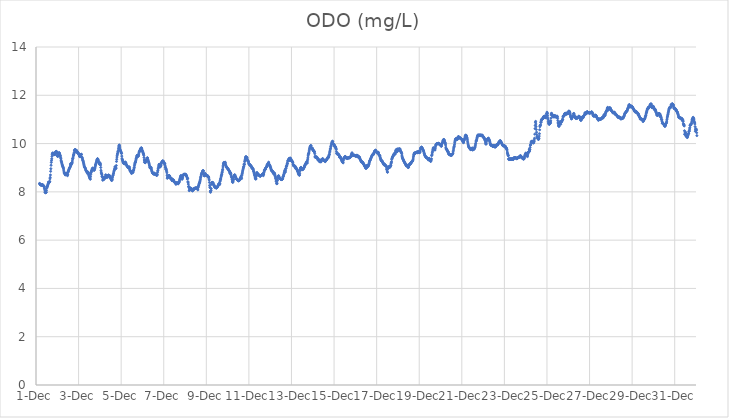
| Category | ODO (mg/L) |
|---|---|
| 44896.166666666664 | 8.35 |
| 44896.177083333336 | 8.34 |
| 44896.1875 | 8.31 |
| 44896.197916666664 | 8.3 |
| 44896.208333333336 | 8.3 |
| 44896.21875 | 8.29 |
| 44896.229166666664 | 8.28 |
| 44896.239583333336 | 8.29 |
| 44896.25 | 8.28 |
| 44896.260416666664 | 8.28 |
| 44896.270833333336 | 8.28 |
| 44896.28125 | 8.28 |
| 44896.291666666664 | 8.29 |
| 44896.302083333336 | 8.3 |
| 44896.3125 | 8.29 |
| 44896.322916666664 | 8.29 |
| 44896.333333333336 | 8.26 |
| 44896.34375 | 8.25 |
| 44896.354166666664 | 8.23 |
| 44896.364583333336 | 8.25 |
| 44896.375 | 8.22 |
| 44896.385416666664 | 8.21 |
| 44896.395833333336 | 8.15 |
| 44896.40625 | 8.11 |
| 44896.416666666664 | 8.04 |
| 44896.427083333336 | 7.98 |
| 44896.4375 | 7.97 |
| 44896.447916666664 | 7.99 |
| 44896.458333333336 | 7.96 |
| 44896.46875 | 7.98 |
| 44896.479166666664 | 7.98 |
| 44896.489583333336 | 8.05 |
| 44896.5 | 8.14 |
| 44896.510416666664 | 8.19 |
| 44896.520833333336 | 8.2 |
| 44896.53125 | 8.22 |
| 44896.541666666664 | 8.25 |
| 44896.552083333336 | 8.28 |
| 44896.5625 | 8.31 |
| 44896.572916666664 | 8.34 |
| 44896.583333333336 | 8.41 |
| 44896.59375 | 8.36 |
| 44896.604166666664 | 8.39 |
| 44896.614583333336 | 8.39 |
| 44896.625 | 8.4 |
| 44896.635416666664 | 8.42 |
| 44896.645833333336 | 8.43 |
| 44896.65625 | 8.54 |
| 44896.666666666664 | 8.6 |
| 44896.677083333336 | 8.7 |
| 44896.6875 | 8.85 |
| 44896.697916666664 | 8.96 |
| 44896.708333333336 | 9.1 |
| 44896.71875 | 9.22 |
| 44896.729166666664 | 9.3 |
| 44896.739583333336 | 9.37 |
| 44896.75 | 9.47 |
| 44896.760416666664 | 9.55 |
| 44896.770833333336 | 9.59 |
| 44896.78125 | 9.6 |
| 44896.791666666664 | 9.61 |
| 44896.802083333336 | 9.6 |
| 44896.8125 | 9.59 |
| 44896.822916666664 | 9.58 |
| 44896.833333333336 | 9.58 |
| 44896.84375 | 9.55 |
| 44896.854166666664 | 9.55 |
| 44896.864583333336 | 9.55 |
| 44896.875 | 9.55 |
| 44896.885416666664 | 9.54 |
| 44896.895833333336 | 9.57 |
| 44896.90625 | 9.63 |
| 44896.916666666664 | 9.65 |
| 44896.927083333336 | 9.63 |
| 44896.9375 | 9.63 |
| 44896.947916666664 | 9.68 |
| 44896.958333333336 | 9.67 |
| 44896.96875 | 9.66 |
| 44896.979166666664 | 9.64 |
| 44896.989583333336 | 9.59 |
| 44897.0 | 9.51 |
| 44897.010416666664 | 9.47 |
| 44897.020833333336 | 9.47 |
| 44897.03125 | 9.48 |
| 44897.041666666664 | 9.5 |
| 44897.052083333336 | 9.55 |
| 44897.0625 | 9.55 |
| 44897.072916666664 | 9.61 |
| 44897.083333333336 | 9.62 |
| 44897.09375 | 9.62 |
| 44897.104166666664 | 9.58 |
| 44897.114583333336 | 9.56 |
| 44897.125 | 9.5 |
| 44897.135416666664 | 9.52 |
| 44897.145833333336 | 9.48 |
| 44897.15625 | 9.42 |
| 44897.166666666664 | 9.38 |
| 44897.177083333336 | 9.31 |
| 44897.1875 | 9.27 |
| 44897.197916666664 | 9.24 |
| 44897.208333333336 | 9.2 |
| 44897.21875 | 9.16 |
| 44897.229166666664 | 9.12 |
| 44897.239583333336 | 9.1 |
| 44897.25 | 9.07 |
| 44897.260416666664 | 9.05 |
| 44897.270833333336 | 9.02 |
| 44897.28125 | 9 |
| 44897.291666666664 | 8.96 |
| 44897.302083333336 | 8.9 |
| 44897.3125 | 8.83 |
| 44897.322916666664 | 8.78 |
| 44897.333333333336 | 8.79 |
| 44897.34375 | 8.77 |
| 44897.354166666664 | 8.75 |
| 44897.364583333336 | 8.72 |
| 44897.375 | 8.7 |
| 44897.385416666664 | 8.75 |
| 44897.395833333336 | 8.76 |
| 44897.40625 | 8.77 |
| 44897.416666666664 | 8.75 |
| 44897.427083333336 | 8.77 |
| 44897.4375 | 8.76 |
| 44897.447916666664 | 8.74 |
| 44897.458333333336 | 8.71 |
| 44897.46875 | 8.7 |
| 44897.479166666664 | 8.67 |
| 44897.489583333336 | 8.72 |
| 44897.5 | 8.8 |
| 44897.510416666664 | 8.83 |
| 44897.520833333336 | 8.87 |
| 44897.53125 | 8.87 |
| 44897.541666666664 | 8.91 |
| 44897.552083333336 | 8.93 |
| 44897.5625 | 8.97 |
| 44897.572916666664 | 8.98 |
| 44897.583333333336 | 9 |
| 44897.59375 | 9.01 |
| 44897.604166666664 | 9.04 |
| 44897.614583333336 | 9.15 |
| 44897.625 | 9.1 |
| 44897.635416666664 | 9.08 |
| 44897.645833333336 | 9.18 |
| 44897.65625 | 9.14 |
| 44897.666666666664 | 9.16 |
| 44897.677083333336 | 9.17 |
| 44897.6875 | 9.19 |
| 44897.697916666664 | 9.22 |
| 44897.708333333336 | 9.28 |
| 44897.71875 | 9.36 |
| 44897.729166666664 | 9.38 |
| 44897.739583333336 | 9.41 |
| 44897.75 | 9.48 |
| 44897.760416666664 | 9.52 |
| 44897.770833333336 | 9.54 |
| 44897.78125 | 9.58 |
| 44897.791666666664 | 9.62 |
| 44897.802083333336 | 9.7 |
| 44897.8125 | 9.72 |
| 44897.822916666664 | 9.74 |
| 44897.833333333336 | 9.75 |
| 44897.84375 | 9.75 |
| 44897.854166666664 | 9.74 |
| 44897.864583333336 | 9.72 |
| 44897.875 | 9.7 |
| 44897.885416666664 | 9.65 |
| 44897.895833333336 | 9.65 |
| 44897.90625 | 9.72 |
| 44897.916666666664 | 9.67 |
| 44897.927083333336 | 9.64 |
| 44897.9375 | 9.65 |
| 44897.947916666664 | 9.66 |
| 44897.958333333336 | 9.64 |
| 44897.96875 | 9.6 |
| 44897.979166666664 | 9.61 |
| 44897.989583333336 | 9.58 |
| 44898.0 | 9.6 |
| 44898.010416666664 | 9.56 |
| 44898.020833333336 | 9.53 |
| 44898.03125 | 9.53 |
| 44898.041666666664 | 9.49 |
| 44898.052083333336 | 9.46 |
| 44898.0625 | 9.46 |
| 44898.072916666664 | 9.47 |
| 44898.083333333336 | 9.49 |
| 44898.09375 | 9.51 |
| 44898.104166666664 | 9.53 |
| 44898.114583333336 | 9.54 |
| 44898.125 | 9.56 |
| 44898.135416666664 | 9.55 |
| 44898.145833333336 | 9.45 |
| 44898.15625 | 9.43 |
| 44898.166666666664 | 9.41 |
| 44898.177083333336 | 9.39 |
| 44898.1875 | 9.34 |
| 44898.197916666664 | 9.31 |
| 44898.208333333336 | 9.29 |
| 44898.21875 | 9.25 |
| 44898.229166666664 | 9.22 |
| 44898.239583333336 | 9.17 |
| 44898.25 | 9.13 |
| 44898.260416666664 | 9.09 |
| 44898.270833333336 | 9.05 |
| 44898.28125 | 9.03 |
| 44898.291666666664 | 9.02 |
| 44898.302083333336 | 9 |
| 44898.3125 | 8.98 |
| 44898.322916666664 | 8.96 |
| 44898.333333333336 | 8.92 |
| 44898.34375 | 8.89 |
| 44898.354166666664 | 8.87 |
| 44898.364583333336 | 8.86 |
| 44898.375 | 8.85 |
| 44898.385416666664 | 8.83 |
| 44898.395833333336 | 8.83 |
| 44898.40625 | 8.81 |
| 44898.416666666664 | 8.76 |
| 44898.427083333336 | 8.81 |
| 44898.4375 | 8.82 |
| 44898.447916666664 | 8.81 |
| 44898.458333333336 | 8.78 |
| 44898.46875 | 8.76 |
| 44898.479166666664 | 8.7 |
| 44898.489583333336 | 8.67 |
| 44898.5 | 8.63 |
| 44898.510416666664 | 8.62 |
| 44898.520833333336 | 8.57 |
| 44898.53125 | 8.6 |
| 44898.541666666664 | 8.56 |
| 44898.552083333336 | 8.52 |
| 44898.5625 | 8.64 |
| 44898.572916666664 | 8.73 |
| 44898.583333333336 | 8.79 |
| 44898.59375 | 8.82 |
| 44898.604166666664 | 8.86 |
| 44898.614583333336 | 8.88 |
| 44898.625 | 8.91 |
| 44898.635416666664 | 8.94 |
| 44898.645833333336 | 8.96 |
| 44898.65625 | 8.98 |
| 44898.666666666664 | 8.98 |
| 44898.677083333336 | 8.95 |
| 44898.6875 | 8.92 |
| 44898.697916666664 | 8.93 |
| 44898.708333333336 | 8.93 |
| 44898.71875 | 8.9 |
| 44898.729166666664 | 8.89 |
| 44898.739583333336 | 8.91 |
| 44898.75 | 8.94 |
| 44898.760416666664 | 8.97 |
| 44898.770833333336 | 9 |
| 44898.78125 | 9.05 |
| 44898.791666666664 | 9.11 |
| 44898.802083333336 | 9.12 |
| 44898.8125 | 9.16 |
| 44898.822916666664 | 9.19 |
| 44898.833333333336 | 9.22 |
| 44898.84375 | 9.26 |
| 44898.854166666664 | 9.31 |
| 44898.864583333336 | 9.32 |
| 44898.875 | 9.35 |
| 44898.885416666664 | 9.37 |
| 44898.895833333336 | 9.37 |
| 44898.90625 | 9.35 |
| 44898.916666666664 | 9.33 |
| 44898.927083333336 | 9.29 |
| 44898.9375 | 9.26 |
| 44898.947916666664 | 9.21 |
| 44898.958333333336 | 9.21 |
| 44898.96875 | 9.2 |
| 44898.979166666664 | 9.15 |
| 44898.989583333336 | 9.14 |
| 44899.0 | 9.21 |
| 44899.010416666664 | 9.17 |
| 44899.020833333336 | 9.16 |
| 44899.03125 | 9.11 |
| 44899.041666666664 | 9.01 |
| 44899.052083333336 | 8.89 |
| 44899.0625 | 8.82 |
| 44899.072916666664 | 8.77 |
| 44899.083333333336 | 8.75 |
| 44899.09375 | 8.71 |
| 44899.104166666664 | 8.64 |
| 44899.114583333336 | 8.64 |
| 44899.125 | 8.6 |
| 44899.135416666664 | 8.48 |
| 44899.145833333336 | 8.52 |
| 44899.15625 | 8.57 |
| 44899.166666666664 | 8.52 |
| 44899.177083333336 | 8.55 |
| 44899.1875 | 8.51 |
| 44899.197916666664 | 8.59 |
| 44899.208333333336 | 8.59 |
| 44899.21875 | 8.55 |
| 44899.229166666664 | 8.57 |
| 44899.239583333336 | 8.58 |
| 44899.25 | 8.59 |
| 44899.260416666664 | 8.62 |
| 44899.270833333336 | 8.7 |
| 44899.28125 | 8.7 |
| 44899.291666666664 | 8.68 |
| 44899.302083333336 | 8.65 |
| 44899.3125 | 8.62 |
| 44899.322916666664 | 8.6 |
| 44899.333333333336 | 8.6 |
| 44899.34375 | 8.61 |
| 44899.354166666664 | 8.63 |
| 44899.364583333336 | 8.64 |
| 44899.375 | 8.66 |
| 44899.385416666664 | 8.67 |
| 44899.395833333336 | 8.69 |
| 44899.40625 | 8.69 |
| 44899.416666666664 | 8.69 |
| 44899.427083333336 | 8.68 |
| 44899.4375 | 8.67 |
| 44899.447916666664 | 8.68 |
| 44899.458333333336 | 8.66 |
| 44899.46875 | 8.58 |
| 44899.479166666664 | 8.62 |
| 44899.489583333336 | 8.61 |
| 44899.5 | 8.6 |
| 44899.510416666664 | 8.57 |
| 44899.520833333336 | 8.55 |
| 44899.53125 | 8.51 |
| 44899.541666666664 | 8.5 |
| 44899.552083333336 | 8.47 |
| 44899.5625 | 8.48 |
| 44899.572916666664 | 8.5 |
| 44899.583333333336 | 8.53 |
| 44899.59375 | 8.6 |
| 44899.604166666664 | 8.66 |
| 44899.614583333336 | 8.69 |
| 44899.625 | 8.7 |
| 44899.635416666664 | 8.75 |
| 44899.645833333336 | 8.78 |
| 44899.65625 | 8.83 |
| 44899.666666666664 | 8.87 |
| 44899.677083333336 | 8.9 |
| 44899.6875 | 8.93 |
| 44899.697916666664 | 8.96 |
| 44899.708333333336 | 9.04 |
| 44899.71875 | 9.01 |
| 44899.729166666664 | 9.02 |
| 44899.739583333336 | 8.96 |
| 44899.75 | 8.97 |
| 44899.760416666664 | 8.99 |
| 44899.770833333336 | 9.09 |
| 44899.78125 | 9.26 |
| 44899.791666666664 | 9.35 |
| 44899.802083333336 | 9.44 |
| 44899.8125 | 9.5 |
| 44899.822916666664 | 9.56 |
| 44899.833333333336 | 9.59 |
| 44899.84375 | 9.65 |
| 44899.854166666664 | 9.66 |
| 44899.864583333336 | 9.72 |
| 44899.875 | 9.8 |
| 44899.885416666664 | 9.86 |
| 44899.895833333336 | 9.91 |
| 44899.90625 | 9.94 |
| 44899.916666666664 | 9.93 |
| 44899.927083333336 | 9.88 |
| 44899.9375 | 9.82 |
| 44899.947916666664 | 9.77 |
| 44899.958333333336 | 9.72 |
| 44899.96875 | 9.72 |
| 44899.979166666664 | 9.69 |
| 44899.989583333336 | 9.67 |
| 44900.0 | 9.63 |
| 44900.010416666664 | 9.6 |
| 44900.020833333336 | 9.59 |
| 44900.03125 | 9.48 |
| 44900.041666666664 | 9.38 |
| 44900.052083333336 | 9.33 |
| 44900.0625 | 9.32 |
| 44900.072916666664 | 9.28 |
| 44900.083333333336 | 9.25 |
| 44900.09375 | 9.22 |
| 44900.104166666664 | 9.2 |
| 44900.114583333336 | 9.18 |
| 44900.125 | 9.18 |
| 44900.135416666664 | 9.17 |
| 44900.145833333336 | 9.16 |
| 44900.15625 | 9.17 |
| 44900.166666666664 | 9.2 |
| 44900.177083333336 | 9.21 |
| 44900.1875 | 9.24 |
| 44900.197916666664 | 9.18 |
| 44900.208333333336 | 9.22 |
| 44900.21875 | 9.2 |
| 44900.229166666664 | 9.15 |
| 44900.239583333336 | 9.14 |
| 44900.25 | 9.13 |
| 44900.260416666664 | 9.1 |
| 44900.270833333336 | 9.07 |
| 44900.28125 | 9.06 |
| 44900.291666666664 | 9.07 |
| 44900.302083333336 | 9.05 |
| 44900.3125 | 9.02 |
| 44900.322916666664 | 9 |
| 44900.333333333336 | 9 |
| 44900.34375 | 8.99 |
| 44900.354166666664 | 9 |
| 44900.364583333336 | 9.01 |
| 44900.375 | 9.03 |
| 44900.385416666664 | 9.03 |
| 44900.395833333336 | 8.96 |
| 44900.40625 | 8.91 |
| 44900.416666666664 | 8.88 |
| 44900.427083333336 | 8.86 |
| 44900.4375 | 8.85 |
| 44900.447916666664 | 8.83 |
| 44900.458333333336 | 8.83 |
| 44900.46875 | 8.84 |
| 44900.479166666664 | 8.82 |
| 44900.489583333336 | 8.76 |
| 44900.5 | 8.78 |
| 44900.510416666664 | 8.81 |
| 44900.520833333336 | 8.81 |
| 44900.53125 | 8.81 |
| 44900.541666666664 | 8.82 |
| 44900.552083333336 | 8.8 |
| 44900.5625 | 8.83 |
| 44900.572916666664 | 8.88 |
| 44900.583333333336 | 8.9 |
| 44900.59375 | 8.91 |
| 44900.604166666664 | 8.98 |
| 44900.614583333336 | 9.01 |
| 44900.625 | 9.08 |
| 44900.635416666664 | 9.14 |
| 44900.645833333336 | 9.18 |
| 44900.65625 | 9.22 |
| 44900.666666666664 | 9.23 |
| 44900.677083333336 | 9.24 |
| 44900.6875 | 9.29 |
| 44900.697916666664 | 9.35 |
| 44900.708333333336 | 9.38 |
| 44900.71875 | 9.42 |
| 44900.729166666664 | 9.45 |
| 44900.739583333336 | 9.49 |
| 44900.75 | 9.51 |
| 44900.760416666664 | 9.51 |
| 44900.770833333336 | 9.49 |
| 44900.78125 | 9.53 |
| 44900.791666666664 | 9.47 |
| 44900.802083333336 | 9.47 |
| 44900.8125 | 9.51 |
| 44900.822916666664 | 9.54 |
| 44900.833333333336 | 9.61 |
| 44900.84375 | 9.65 |
| 44900.854166666664 | 9.66 |
| 44900.864583333336 | 9.68 |
| 44900.875 | 9.71 |
| 44900.885416666664 | 9.73 |
| 44900.895833333336 | 9.73 |
| 44900.90625 | 9.76 |
| 44900.916666666664 | 9.79 |
| 44900.927083333336 | 9.8 |
| 44900.9375 | 9.82 |
| 44900.947916666664 | 9.82 |
| 44900.958333333336 | 9.81 |
| 44900.96875 | 9.78 |
| 44900.979166666664 | 9.74 |
| 44900.989583333336 | 9.71 |
| 44901.0 | 9.68 |
| 44901.010416666664 | 9.67 |
| 44901.020833333336 | 9.63 |
| 44901.03125 | 9.61 |
| 44901.041666666664 | 9.58 |
| 44901.052083333336 | 9.56 |
| 44901.0625 | 9.51 |
| 44901.072916666664 | 9.42 |
| 44901.083333333336 | 9.32 |
| 44901.09375 | 9.23 |
| 44901.104166666664 | 9.31 |
| 44901.114583333336 | 9.27 |
| 44901.125 | 9.21 |
| 44901.135416666664 | 9.21 |
| 44901.145833333336 | 9.26 |
| 44901.15625 | 9.25 |
| 44901.166666666664 | 9.29 |
| 44901.177083333336 | 9.3 |
| 44901.1875 | 9.33 |
| 44901.197916666664 | 9.35 |
| 44901.208333333336 | 9.38 |
| 44901.21875 | 9.4 |
| 44901.229166666664 | 9.41 |
| 44901.239583333336 | 9.4 |
| 44901.25 | 9.33 |
| 44901.260416666664 | 9.32 |
| 44901.270833333336 | 9.28 |
| 44901.28125 | 9.26 |
| 44901.291666666664 | 9.23 |
| 44901.302083333336 | 9.2 |
| 44901.3125 | 9.17 |
| 44901.322916666664 | 9.12 |
| 44901.333333333336 | 9.08 |
| 44901.34375 | 9.03 |
| 44901.354166666664 | 9 |
| 44901.364583333336 | 8.99 |
| 44901.375 | 8.98 |
| 44901.385416666664 | 8.99 |
| 44901.395833333336 | 9.01 |
| 44901.40625 | 9.01 |
| 44901.416666666664 | 8.97 |
| 44901.427083333336 | 8.91 |
| 44901.4375 | 8.87 |
| 44901.447916666664 | 8.84 |
| 44901.458333333336 | 8.82 |
| 44901.46875 | 8.79 |
| 44901.479166666664 | 8.78 |
| 44901.489583333336 | 8.77 |
| 44901.5 | 8.76 |
| 44901.510416666664 | 8.76 |
| 44901.520833333336 | 8.73 |
| 44901.53125 | 8.76 |
| 44901.541666666664 | 8.77 |
| 44901.552083333336 | 8.78 |
| 44901.5625 | 8.75 |
| 44901.572916666664 | 8.74 |
| 44901.583333333336 | 8.73 |
| 44901.59375 | 8.74 |
| 44901.604166666664 | 8.72 |
| 44901.614583333336 | 8.74 |
| 44901.625 | 8.72 |
| 44901.635416666664 | 8.71 |
| 44901.645833333336 | 8.7 |
| 44901.65625 | 8.71 |
| 44901.666666666664 | 8.68 |
| 44901.677083333336 | 8.69 |
| 44901.6875 | 8.7 |
| 44901.697916666664 | 8.73 |
| 44901.708333333336 | 8.81 |
| 44901.71875 | 8.87 |
| 44901.729166666664 | 8.9 |
| 44901.739583333336 | 8.96 |
| 44901.75 | 9 |
| 44901.760416666664 | 9.06 |
| 44901.770833333336 | 9.1 |
| 44901.78125 | 9.14 |
| 44901.791666666664 | 9.14 |
| 44901.802083333336 | 9.08 |
| 44901.8125 | 9.07 |
| 44901.822916666664 | 9.05 |
| 44901.833333333336 | 9.03 |
| 44901.84375 | 9.07 |
| 44901.854166666664 | 9.06 |
| 44901.864583333336 | 9.1 |
| 44901.875 | 9.12 |
| 44901.885416666664 | 9.18 |
| 44901.895833333336 | 9.21 |
| 44901.90625 | 9.23 |
| 44901.916666666664 | 9.23 |
| 44901.927083333336 | 9.25 |
| 44901.9375 | 9.27 |
| 44901.947916666664 | 9.28 |
| 44901.958333333336 | 9.28 |
| 44901.96875 | 9.27 |
| 44901.979166666664 | 9.26 |
| 44901.989583333336 | 9.26 |
| 44902.0 | 9.23 |
| 44902.010416666664 | 9.22 |
| 44902.020833333336 | 9.2 |
| 44902.03125 | 9.16 |
| 44902.041666666664 | 9.17 |
| 44902.052083333336 | 9.16 |
| 44902.0625 | 9.1 |
| 44902.072916666664 | 9.02 |
| 44902.083333333336 | 9.02 |
| 44902.09375 | 8.94 |
| 44902.104166666664 | 8.96 |
| 44902.114583333336 | 8.94 |
| 44902.125 | 8.9 |
| 44902.135416666664 | 8.85 |
| 44902.145833333336 | 8.79 |
| 44902.15625 | 8.69 |
| 44902.166666666664 | 8.56 |
| 44902.177083333336 | 8.61 |
| 44902.1875 | 8.59 |
| 44902.197916666664 | 8.63 |
| 44902.208333333336 | 8.6 |
| 44902.21875 | 8.65 |
| 44902.229166666664 | 8.65 |
| 44902.239583333336 | 8.67 |
| 44902.25 | 8.68 |
| 44902.260416666664 | 8.67 |
| 44902.270833333336 | 8.66 |
| 44902.28125 | 8.65 |
| 44902.291666666664 | 8.6 |
| 44902.302083333336 | 8.58 |
| 44902.3125 | 8.57 |
| 44902.322916666664 | 8.55 |
| 44902.333333333336 | 8.54 |
| 44902.34375 | 8.54 |
| 44902.354166666664 | 8.56 |
| 44902.364583333336 | 8.56 |
| 44902.375 | 8.52 |
| 44902.385416666664 | 8.48 |
| 44902.395833333336 | 8.46 |
| 44902.40625 | 8.47 |
| 44902.416666666664 | 8.48 |
| 44902.427083333336 | 8.49 |
| 44902.4375 | 8.5 |
| 44902.447916666664 | 8.5 |
| 44902.458333333336 | 8.48 |
| 44902.46875 | 8.46 |
| 44902.479166666664 | 8.44 |
| 44902.489583333336 | 8.42 |
| 44902.5 | 8.41 |
| 44902.510416666664 | 8.4 |
| 44902.520833333336 | 8.4 |
| 44902.53125 | 8.38 |
| 44902.541666666664 | 8.36 |
| 44902.552083333336 | 8.37 |
| 44902.5625 | 8.37 |
| 44902.572916666664 | 8.31 |
| 44902.583333333336 | 8.38 |
| 44902.59375 | 8.37 |
| 44902.604166666664 | 8.35 |
| 44902.614583333336 | 8.37 |
| 44902.625 | 8.35 |
| 44902.635416666664 | 8.38 |
| 44902.645833333336 | 8.37 |
| 44902.65625 | 8.35 |
| 44902.666666666664 | 8.35 |
| 44902.677083333336 | 8.33 |
| 44902.6875 | 8.37 |
| 44902.697916666664 | 8.36 |
| 44902.708333333336 | 8.38 |
| 44902.71875 | 8.4 |
| 44902.729166666664 | 8.42 |
| 44902.739583333336 | 8.46 |
| 44902.75 | 8.52 |
| 44902.760416666664 | 8.53 |
| 44902.770833333336 | 8.57 |
| 44902.78125 | 8.6 |
| 44902.791666666664 | 8.64 |
| 44902.802083333336 | 8.66 |
| 44902.8125 | 8.68 |
| 44902.822916666664 | 8.64 |
| 44902.833333333336 | 8.58 |
| 44902.84375 | 8.57 |
| 44902.854166666664 | 8.54 |
| 44902.864583333336 | 8.52 |
| 44902.875 | 8.57 |
| 44902.885416666664 | 8.59 |
| 44902.895833333336 | 8.65 |
| 44902.90625 | 8.69 |
| 44902.916666666664 | 8.7 |
| 44902.927083333336 | 8.71 |
| 44902.9375 | 8.72 |
| 44902.947916666664 | 8.73 |
| 44902.958333333336 | 8.72 |
| 44902.96875 | 8.72 |
| 44902.979166666664 | 8.73 |
| 44902.989583333336 | 8.72 |
| 44903.0 | 8.73 |
| 44903.010416666664 | 8.73 |
| 44903.020833333336 | 8.72 |
| 44903.03125 | 8.69 |
| 44903.041666666664 | 8.72 |
| 44903.052083333336 | 8.69 |
| 44903.0625 | 8.68 |
| 44903.072916666664 | 8.65 |
| 44903.083333333336 | 8.65 |
| 44903.09375 | 8.59 |
| 44903.104166666664 | 8.53 |
| 44903.114583333336 | 8.55 |
| 44903.125 | 8.56 |
| 44903.135416666664 | 8.42 |
| 44903.145833333336 | 8.39 |
| 44903.15625 | 8.32 |
| 44903.166666666664 | 8.22 |
| 44903.177083333336 | 8.22 |
| 44903.1875 | 8.17 |
| 44903.197916666664 | 8.05 |
| 44903.208333333336 | 8.06 |
| 44903.21875 | 8.11 |
| 44903.229166666664 | 8.17 |
| 44903.239583333336 | 8.09 |
| 44903.25 | 8.15 |
| 44903.260416666664 | 8.14 |
| 44903.270833333336 | 8.15 |
| 44903.28125 | 8.14 |
| 44903.291666666664 | 8.14 |
| 44903.302083333336 | 8.13 |
| 44903.3125 | 8.12 |
| 44903.322916666664 | 8.07 |
| 44903.333333333336 | 8.08 |
| 44903.34375 | 8.05 |
| 44903.354166666664 | 8.04 |
| 44903.364583333336 | 8.06 |
| 44903.375 | 8.08 |
| 44903.385416666664 | 8.09 |
| 44903.395833333336 | 8.13 |
| 44903.40625 | 8.12 |
| 44903.416666666664 | 8.11 |
| 44903.427083333336 | 8.11 |
| 44903.4375 | 8.12 |
| 44903.447916666664 | 8.13 |
| 44903.458333333336 | 8.14 |
| 44903.46875 | 8.16 |
| 44903.479166666664 | 8.16 |
| 44903.489583333336 | 8.15 |
| 44903.5 | 8.15 |
| 44903.510416666664 | 8.16 |
| 44903.520833333336 | 8.16 |
| 44903.53125 | 8.16 |
| 44903.541666666664 | 8.15 |
| 44903.552083333336 | 8.16 |
| 44903.5625 | 8.16 |
| 44903.572916666664 | 8.14 |
| 44903.583333333336 | 8.14 |
| 44903.59375 | 8.12 |
| 44903.604166666664 | 8.08 |
| 44903.614583333336 | 8.18 |
| 44903.625 | 8.21 |
| 44903.635416666664 | 8.26 |
| 44903.645833333336 | 8.28 |
| 44903.65625 | 8.32 |
| 44903.666666666664 | 8.35 |
| 44903.677083333336 | 8.37 |
| 44903.6875 | 8.4 |
| 44903.697916666664 | 8.42 |
| 44903.708333333336 | 8.47 |
| 44903.71875 | 8.52 |
| 44903.729166666664 | 8.58 |
| 44903.739583333336 | 8.62 |
| 44903.75 | 8.65 |
| 44903.760416666664 | 8.7 |
| 44903.770833333336 | 8.73 |
| 44903.78125 | 8.77 |
| 44903.791666666664 | 8.77 |
| 44903.802083333336 | 8.79 |
| 44903.8125 | 8.81 |
| 44903.822916666664 | 8.85 |
| 44903.833333333336 | 8.86 |
| 44903.84375 | 8.88 |
| 44903.854166666664 | 8.88 |
| 44903.864583333336 | 8.86 |
| 44903.875 | 8.76 |
| 44903.885416666664 | 8.73 |
| 44903.895833333336 | 8.67 |
| 44903.90625 | 8.66 |
| 44903.916666666664 | 8.68 |
| 44903.927083333336 | 8.71 |
| 44903.9375 | 8.75 |
| 44903.947916666664 | 8.76 |
| 44903.958333333336 | 8.74 |
| 44903.96875 | 8.71 |
| 44903.979166666664 | 8.69 |
| 44903.989583333336 | 8.69 |
| 44904.0 | 8.67 |
| 44904.010416666664 | 8.68 |
| 44904.020833333336 | 8.67 |
| 44904.03125 | 8.68 |
| 44904.041666666664 | 8.67 |
| 44904.052083333336 | 8.67 |
| 44904.0625 | 8.67 |
| 44904.072916666664 | 8.63 |
| 44904.083333333336 | 8.64 |
| 44904.09375 | 8.62 |
| 44904.104166666664 | 8.59 |
| 44904.114583333336 | 8.61 |
| 44904.125 | 8.53 |
| 44904.135416666664 | 8.49 |
| 44904.145833333336 | 8.39 |
| 44904.15625 | 8.27 |
| 44904.166666666664 | 8.2 |
| 44904.177083333336 | 8.17 |
| 44904.1875 | 8.03 |
| 44904.197916666664 | 7.98 |
| 44904.208333333336 | 8.05 |
| 44904.21875 | 8.05 |
| 44904.229166666664 | 8.13 |
| 44904.239583333336 | 8.32 |
| 44904.25 | 8.32 |
| 44904.260416666664 | 8.38 |
| 44904.270833333336 | 8.39 |
| 44904.28125 | 8.39 |
| 44904.291666666664 | 8.38 |
| 44904.302083333336 | 8.39 |
| 44904.3125 | 8.36 |
| 44904.322916666664 | 8.36 |
| 44904.333333333336 | 8.3 |
| 44904.34375 | 8.3 |
| 44904.354166666664 | 8.29 |
| 44904.364583333336 | 8.25 |
| 44904.375 | 8.23 |
| 44904.385416666664 | 8.22 |
| 44904.395833333336 | 8.21 |
| 44904.40625 | 8.19 |
| 44904.416666666664 | 8.18 |
| 44904.427083333336 | 8.2 |
| 44904.4375 | 8.2 |
| 44904.447916666664 | 8.18 |
| 44904.458333333336 | 8.16 |
| 44904.46875 | 8.16 |
| 44904.479166666664 | 8.17 |
| 44904.489583333336 | 8.17 |
| 44904.5 | 8.18 |
| 44904.510416666664 | 8.2 |
| 44904.520833333336 | 8.21 |
| 44904.53125 | 8.22 |
| 44904.541666666664 | 8.24 |
| 44904.552083333336 | 8.27 |
| 44904.5625 | 8.27 |
| 44904.572916666664 | 8.3 |
| 44904.583333333336 | 8.32 |
| 44904.59375 | 8.34 |
| 44904.604166666664 | 8.35 |
| 44904.614583333336 | 8.33 |
| 44904.625 | 8.3 |
| 44904.635416666664 | 8.34 |
| 44904.645833333336 | 8.43 |
| 44904.65625 | 8.47 |
| 44904.666666666664 | 8.53 |
| 44904.677083333336 | 8.53 |
| 44904.6875 | 8.58 |
| 44904.697916666664 | 8.65 |
| 44904.708333333336 | 8.67 |
| 44904.71875 | 8.72 |
| 44904.729166666664 | 8.74 |
| 44904.739583333336 | 8.8 |
| 44904.75 | 8.83 |
| 44904.760416666664 | 8.9 |
| 44904.770833333336 | 8.94 |
| 44904.78125 | 9.03 |
| 44904.791666666664 | 9.1 |
| 44904.802083333336 | 9.16 |
| 44904.8125 | 9.17 |
| 44904.822916666664 | 9.22 |
| 44904.833333333336 | 9.2 |
| 44904.84375 | 9.21 |
| 44904.854166666664 | 9.2 |
| 44904.864583333336 | 9.21 |
| 44904.875 | 9.22 |
| 44904.885416666664 | 9.23 |
| 44904.895833333336 | 9.18 |
| 44904.90625 | 9.12 |
| 44904.916666666664 | 9.1 |
| 44904.927083333336 | 9.06 |
| 44904.9375 | 9.03 |
| 44904.947916666664 | 9.02 |
| 44904.958333333336 | 9.03 |
| 44904.96875 | 9.01 |
| 44904.979166666664 | 8.99 |
| 44904.989583333336 | 8.97 |
| 44905.0 | 8.97 |
| 44905.010416666664 | 8.96 |
| 44905.020833333336 | 8.95 |
| 44905.03125 | 8.93 |
| 44905.041666666664 | 8.92 |
| 44905.052083333336 | 8.91 |
| 44905.0625 | 8.88 |
| 44905.072916666664 | 8.87 |
| 44905.083333333336 | 8.86 |
| 44905.09375 | 8.83 |
| 44905.104166666664 | 8.8 |
| 44905.114583333336 | 8.76 |
| 44905.125 | 8.76 |
| 44905.135416666664 | 8.8 |
| 44905.145833333336 | 8.77 |
| 44905.15625 | 8.74 |
| 44905.166666666664 | 8.69 |
| 44905.177083333336 | 8.64 |
| 44905.1875 | 8.61 |
| 44905.197916666664 | 8.58 |
| 44905.208333333336 | 8.52 |
| 44905.21875 | 8.45 |
| 44905.229166666664 | 8.42 |
| 44905.239583333336 | 8.39 |
| 44905.25 | 8.41 |
| 44905.260416666664 | 8.45 |
| 44905.270833333336 | 8.52 |
| 44905.28125 | 8.51 |
| 44905.291666666664 | 8.61 |
| 44905.302083333336 | 8.65 |
| 44905.3125 | 8.69 |
| 44905.322916666664 | 8.69 |
| 44905.333333333336 | 8.7 |
| 44905.34375 | 8.7 |
| 44905.354166666664 | 8.66 |
| 44905.364583333336 | 8.64 |
| 44905.375 | 8.62 |
| 44905.385416666664 | 8.58 |
| 44905.395833333336 | 8.57 |
| 44905.40625 | 8.55 |
| 44905.416666666664 | 8.54 |
| 44905.427083333336 | 8.52 |
| 44905.4375 | 8.52 |
| 44905.447916666664 | 8.51 |
| 44905.458333333336 | 8.49 |
| 44905.46875 | 8.49 |
| 44905.479166666664 | 8.48 |
| 44905.489583333336 | 8.48 |
| 44905.5 | 8.47 |
| 44905.510416666664 | 8.46 |
| 44905.520833333336 | 8.46 |
| 44905.53125 | 8.46 |
| 44905.541666666664 | 8.47 |
| 44905.552083333336 | 8.48 |
| 44905.5625 | 8.51 |
| 44905.572916666664 | 8.52 |
| 44905.583333333336 | 8.53 |
| 44905.59375 | 8.55 |
| 44905.604166666664 | 8.58 |
| 44905.614583333336 | 8.59 |
| 44905.625 | 8.62 |
| 44905.635416666664 | 8.65 |
| 44905.645833333336 | 8.59 |
| 44905.65625 | 8.55 |
| 44905.666666666664 | 8.68 |
| 44905.677083333336 | 8.73 |
| 44905.6875 | 8.77 |
| 44905.697916666664 | 8.82 |
| 44905.708333333336 | 8.87 |
| 44905.71875 | 8.91 |
| 44905.729166666664 | 8.95 |
| 44905.739583333336 | 8.99 |
| 44905.75 | 9.03 |
| 44905.760416666664 | 9.06 |
| 44905.770833333336 | 9.13 |
| 44905.78125 | 9.16 |
| 44905.791666666664 | 9.13 |
| 44905.802083333336 | 9.25 |
| 44905.8125 | 9.29 |
| 44905.822916666664 | 9.35 |
| 44905.833333333336 | 9.4 |
| 44905.84375 | 9.42 |
| 44905.854166666664 | 9.46 |
| 44905.864583333336 | 9.45 |
| 44905.875 | 9.43 |
| 44905.885416666664 | 9.44 |
| 44905.895833333336 | 9.42 |
| 44905.90625 | 9.43 |
| 44905.916666666664 | 9.39 |
| 44905.927083333336 | 9.33 |
| 44905.9375 | 9.31 |
| 44905.947916666664 | 9.28 |
| 44905.958333333336 | 9.28 |
| 44905.96875 | 9.27 |
| 44905.979166666664 | 9.25 |
| 44905.989583333336 | 9.19 |
| 44906.0 | 9.16 |
| 44906.010416666664 | 9.15 |
| 44906.020833333336 | 9.14 |
| 44906.03125 | 9.14 |
| 44906.041666666664 | 9.11 |
| 44906.052083333336 | 9.11 |
| 44906.0625 | 9.11 |
| 44906.072916666664 | 9.1 |
| 44906.083333333336 | 9.09 |
| 44906.09375 | 9.07 |
| 44906.104166666664 | 9.06 |
| 44906.114583333336 | 9.05 |
| 44906.125 | 9.04 |
| 44906.135416666664 | 9.03 |
| 44906.145833333336 | 8.98 |
| 44906.15625 | 8.97 |
| 44906.166666666664 | 8.98 |
| 44906.177083333336 | 8.97 |
| 44906.1875 | 8.96 |
| 44906.197916666664 | 8.94 |
| 44906.208333333336 | 8.91 |
| 44906.21875 | 8.86 |
| 44906.229166666664 | 8.84 |
| 44906.239583333336 | 8.81 |
| 44906.25 | 8.76 |
| 44906.260416666664 | 8.71 |
| 44906.270833333336 | 8.69 |
| 44906.28125 | 8.65 |
| 44906.291666666664 | 8.58 |
| 44906.302083333336 | 8.57 |
| 44906.3125 | 8.54 |
| 44906.322916666664 | 8.53 |
| 44906.333333333336 | 8.54 |
| 44906.34375 | 8.63 |
| 44906.354166666664 | 8.69 |
| 44906.364583333336 | 8.77 |
| 44906.375 | 8.8 |
| 44906.385416666664 | 8.78 |
| 44906.395833333336 | 8.78 |
| 44906.40625 | 8.72 |
| 44906.416666666664 | 8.72 |
| 44906.427083333336 | 8.72 |
| 44906.4375 | 8.71 |
| 44906.447916666664 | 8.7 |
| 44906.458333333336 | 8.7 |
| 44906.46875 | 8.7 |
| 44906.479166666664 | 8.7 |
| 44906.489583333336 | 8.69 |
| 44906.5 | 8.68 |
| 44906.510416666664 | 8.66 |
| 44906.520833333336 | 8.65 |
| 44906.53125 | 8.65 |
| 44906.541666666664 | 8.66 |
| 44906.552083333336 | 8.66 |
| 44906.5625 | 8.67 |
| 44906.572916666664 | 8.68 |
| 44906.583333333336 | 8.69 |
| 44906.59375 | 8.69 |
| 44906.604166666664 | 8.7 |
| 44906.614583333336 | 8.71 |
| 44906.625 | 8.72 |
| 44906.635416666664 | 8.73 |
| 44906.645833333336 | 8.74 |
| 44906.65625 | 8.75 |
| 44906.666666666664 | 8.75 |
| 44906.677083333336 | 8.67 |
| 44906.6875 | 8.73 |
| 44906.697916666664 | 8.74 |
| 44906.708333333336 | 8.81 |
| 44906.71875 | 8.86 |
| 44906.729166666664 | 8.88 |
| 44906.739583333336 | 8.92 |
| 44906.75 | 8.93 |
| 44906.760416666664 | 8.92 |
| 44906.770833333336 | 8.95 |
| 44906.78125 | 8.94 |
| 44906.791666666664 | 9 |
| 44906.802083333336 | 9 |
| 44906.8125 | 9.02 |
| 44906.822916666664 | 9.03 |
| 44906.833333333336 | 9.04 |
| 44906.84375 | 9.08 |
| 44906.854166666664 | 9.12 |
| 44906.864583333336 | 9.09 |
| 44906.875 | 9.14 |
| 44906.885416666664 | 9.14 |
| 44906.895833333336 | 9.18 |
| 44906.90625 | 9.16 |
| 44906.916666666664 | 9.19 |
| 44906.927083333336 | 9.23 |
| 44906.9375 | 9.19 |
| 44906.947916666664 | 9.13 |
| 44906.958333333336 | 9.09 |
| 44906.96875 | 9.12 |
| 44906.979166666664 | 9.1 |
| 44906.989583333336 | 9.08 |
| 44907.0 | 9.05 |
| 44907.010416666664 | 9.02 |
| 44907.020833333336 | 9 |
| 44907.03125 | 8.97 |
| 44907.041666666664 | 8.93 |
| 44907.052083333336 | 8.9 |
| 44907.0625 | 8.89 |
| 44907.072916666664 | 8.87 |
| 44907.083333333336 | 8.86 |
| 44907.09375 | 8.86 |
| 44907.104166666664 | 8.86 |
| 44907.114583333336 | 8.85 |
| 44907.125 | 8.83 |
| 44907.135416666664 | 8.8 |
| 44907.145833333336 | 8.77 |
| 44907.15625 | 8.78 |
| 44907.166666666664 | 8.78 |
| 44907.177083333336 | 8.73 |
| 44907.1875 | 8.79 |
| 44907.197916666664 | 8.77 |
| 44907.208333333336 | 8.75 |
| 44907.21875 | 8.71 |
| 44907.229166666664 | 8.67 |
| 44907.239583333336 | 8.64 |
| 44907.25 | 8.58 |
| 44907.260416666664 | 8.56 |
| 44907.270833333336 | 8.5 |
| 44907.28125 | 8.43 |
| 44907.291666666664 | 8.46 |
| 44907.302083333336 | 8.34 |
| 44907.3125 | 8.37 |
| 44907.322916666664 | 8.34 |
| 44907.333333333336 | 8.52 |
| 44907.34375 | 8.47 |
| 44907.354166666664 | 8.6 |
| 44907.364583333336 | 8.63 |
| 44907.375 | 8.64 |
| 44907.385416666664 | 8.66 |
| 44907.395833333336 | 8.67 |
| 44907.40625 | 8.61 |
| 44907.416666666664 | 8.63 |
| 44907.427083333336 | 8.56 |
| 44907.4375 | 8.56 |
| 44907.447916666664 | 8.56 |
| 44907.458333333336 | 8.56 |
| 44907.46875 | 8.55 |
| 44907.479166666664 | 8.54 |
| 44907.489583333336 | 8.53 |
| 44907.5 | 8.52 |
| 44907.510416666664 | 8.52 |
| 44907.520833333336 | 8.52 |
| 44907.53125 | 8.51 |
| 44907.541666666664 | 8.51 |
| 44907.552083333336 | 8.52 |
| 44907.5625 | 8.52 |
| 44907.572916666664 | 8.53 |
| 44907.583333333336 | 8.55 |
| 44907.59375 | 8.58 |
| 44907.604166666664 | 8.63 |
| 44907.614583333336 | 8.64 |
| 44907.625 | 8.67 |
| 44907.635416666664 | 8.71 |
| 44907.645833333336 | 8.74 |
| 44907.65625 | 8.78 |
| 44907.666666666664 | 8.81 |
| 44907.677083333336 | 8.86 |
| 44907.6875 | 8.9 |
| 44907.697916666664 | 8.86 |
| 44907.708333333336 | 8.81 |
| 44907.71875 | 8.87 |
| 44907.729166666664 | 8.96 |
| 44907.739583333336 | 8.97 |
| 44907.75 | 9.03 |
| 44907.760416666664 | 9.06 |
| 44907.770833333336 | 9.06 |
| 44907.78125 | 9.1 |
| 44907.791666666664 | 9.15 |
| 44907.802083333336 | 9.19 |
| 44907.8125 | 9.17 |
| 44907.822916666664 | 9.27 |
| 44907.833333333336 | 9.3 |
| 44907.84375 | 9.28 |
| 44907.854166666664 | 9.32 |
| 44907.864583333336 | 9.32 |
| 44907.875 | 9.36 |
| 44907.885416666664 | 9.37 |
| 44907.895833333336 | 9.39 |
| 44907.90625 | 9.3 |
| 44907.916666666664 | 9.37 |
| 44907.927083333336 | 9.35 |
| 44907.9375 | 9.4 |
| 44907.947916666664 | 9.3 |
| 44907.958333333336 | 9.39 |
| 44907.96875 | 9.34 |
| 44907.979166666664 | 9.35 |
| 44907.989583333336 | 9.3 |
| 44908.0 | 9.3 |
| 44908.010416666664 | 9.29 |
| 44908.020833333336 | 9.28 |
| 44908.03125 | 9.26 |
| 44908.041666666664 | 9.25 |
| 44908.052083333336 | 9.24 |
| 44908.0625 | 9.21 |
| 44908.072916666664 | 9.15 |
| 44908.083333333336 | 9.12 |
| 44908.09375 | 9.09 |
| 44908.104166666664 | 9.08 |
| 44908.114583333336 | 9.07 |
| 44908.125 | 9.08 |
| 44908.135416666664 | 9.07 |
| 44908.145833333336 | 9.07 |
| 44908.15625 | 9.07 |
| 44908.166666666664 | 9.06 |
| 44908.177083333336 | 9.05 |
| 44908.1875 | 9.03 |
| 44908.197916666664 | 8.97 |
| 44908.208333333336 | 8.96 |
| 44908.21875 | 8.97 |
| 44908.229166666664 | 8.97 |
| 44908.239583333336 | 8.97 |
| 44908.25 | 8.94 |
| 44908.260416666664 | 8.92 |
| 44908.270833333336 | 8.9 |
| 44908.28125 | 8.87 |
| 44908.291666666664 | 8.85 |
| 44908.302083333336 | 8.83 |
| 44908.3125 | 8.8 |
| 44908.322916666664 | 8.77 |
| 44908.333333333336 | 8.75 |
| 44908.34375 | 8.72 |
| 44908.354166666664 | 8.71 |
| 44908.364583333336 | 8.69 |
| 44908.375 | 8.69 |
| 44908.385416666664 | 8.77 |
| 44908.395833333336 | 8.92 |
| 44908.40625 | 8.87 |
| 44908.416666666664 | 8.98 |
| 44908.427083333336 | 8.99 |
| 44908.4375 | 9.01 |
| 44908.447916666664 | 8.99 |
| 44908.458333333336 | 9.01 |
| 44908.46875 | 8.95 |
| 44908.479166666664 | 8.94 |
| 44908.489583333336 | 8.94 |
| 44908.5 | 8.93 |
| 44908.510416666664 | 8.93 |
| 44908.520833333336 | 8.92 |
| 44908.53125 | 8.94 |
| 44908.541666666664 | 8.94 |
| 44908.552083333336 | 8.95 |
| 44908.5625 | 8.96 |
| 44908.572916666664 | 8.98 |
| 44908.583333333336 | 9 |
| 44908.59375 | 9.01 |
| 44908.604166666664 | 9.03 |
| 44908.614583333336 | 9.09 |
| 44908.625 | 9.07 |
| 44908.635416666664 | 9.1 |
| 44908.645833333336 | 9.12 |
| 44908.65625 | 9.14 |
| 44908.666666666664 | 9.16 |
| 44908.677083333336 | 9.18 |
| 44908.6875 | 9.2 |
| 44908.697916666664 | 9.2 |
| 44908.708333333336 | 9.25 |
| 44908.71875 | 9.22 |
| 44908.729166666664 | 9.2 |
| 44908.739583333336 | 9.19 |
| 44908.75 | 9.28 |
| 44908.760416666664 | 9.35 |
| 44908.770833333336 | 9.41 |
| 44908.78125 | 9.49 |
| 44908.791666666664 | 9.54 |
| 44908.802083333336 | 9.59 |
| 44908.8125 | 9.6 |
| 44908.822916666664 | 9.65 |
| 44908.833333333336 | 9.7 |
| 44908.84375 | 9.76 |
| 44908.854166666664 | 9.8 |
| 44908.864583333336 | 9.84 |
| 44908.875 | 9.87 |
| 44908.885416666664 | 9.85 |
| 44908.895833333336 | 9.91 |
| 44908.90625 | 9.92 |
| 44908.916666666664 | 9.91 |
| 44908.927083333336 | 9.84 |
| 44908.9375 | 9.81 |
| 44908.947916666664 | 9.8 |
| 44908.958333333336 | 9.81 |
| 44908.96875 | 9.82 |
| 44908.979166666664 | 9.8 |
| 44908.989583333336 | 9.79 |
| 44909.0 | 9.76 |
| 44909.010416666664 | 9.71 |
| 44909.020833333336 | 9.72 |
| 44909.03125 | 9.72 |
| 44909.041666666664 | 9.71 |
| 44909.052083333336 | 9.68 |
| 44909.0625 | 9.68 |
| 44909.072916666664 | 9.67 |
| 44909.083333333336 | 9.65 |
| 44909.09375 | 9.58 |
| 44909.104166666664 | 9.47 |
| 44909.114583333336 | 9.43 |
| 44909.125 | 9.44 |
| 44909.135416666664 | 9.44 |
| 44909.145833333336 | 9.44 |
| 44909.15625 | 9.43 |
| 44909.166666666664 | 9.44 |
| 44909.177083333336 | 9.45 |
| 44909.1875 | 9.44 |
| 44909.197916666664 | 9.43 |
| 44909.208333333336 | 9.41 |
| 44909.21875 | 9.39 |
| 44909.229166666664 | 9.36 |
| 44909.239583333336 | 9.34 |
| 44909.25 | 9.31 |
| 44909.260416666664 | 9.35 |
| 44909.270833333336 | 9.35 |
| 44909.28125 | 9.33 |
| 44909.291666666664 | 9.31 |
| 44909.302083333336 | 9.28 |
| 44909.3125 | 9.26 |
| 44909.322916666664 | 9.25 |
| 44909.333333333336 | 9.27 |
| 44909.34375 | 9.25 |
| 44909.354166666664 | 9.26 |
| 44909.364583333336 | 9.27 |
| 44909.375 | 9.24 |
| 44909.385416666664 | 9.28 |
| 44909.395833333336 | 9.25 |
| 44909.40625 | 9.34 |
| 44909.416666666664 | 9.34 |
| 44909.427083333336 | 9.32 |
| 44909.4375 | 9.34 |
| 44909.447916666664 | 9.36 |
| 44909.458333333336 | 9.37 |
| 44909.46875 | 9.37 |
| 44909.479166666664 | 9.36 |
| 44909.489583333336 | 9.34 |
| 44909.5 | 9.3 |
| 44909.510416666664 | 9.3 |
| 44909.520833333336 | 9.3 |
| 44909.53125 | 9.29 |
| 44909.541666666664 | 9.3 |
| 44909.552083333336 | 9.3 |
| 44909.5625 | 9.28 |
| 44909.572916666664 | 9.3 |
| 44909.583333333336 | 9.25 |
| 44909.59375 | 9.27 |
| 44909.604166666664 | 9.28 |
| 44909.614583333336 | 9.31 |
| 44909.625 | 9.31 |
| 44909.635416666664 | 9.31 |
| 44909.645833333336 | 9.34 |
| 44909.65625 | 9.34 |
| 44909.666666666664 | 9.36 |
| 44909.677083333336 | 9.37 |
| 44909.6875 | 9.39 |
| 44909.697916666664 | 9.4 |
| 44909.708333333336 | 9.41 |
| 44909.71875 | 9.43 |
| 44909.729166666664 | 9.46 |
| 44909.739583333336 | 9.42 |
| 44909.75 | 9.45 |
| 44909.760416666664 | 9.5 |
| 44909.770833333336 | 9.54 |
| 44909.78125 | 9.56 |
| 44909.791666666664 | 9.63 |
| 44909.802083333336 | 9.68 |
| 44909.8125 | 9.73 |
| 44909.822916666664 | 9.78 |
| 44909.833333333336 | 9.79 |
| 44909.84375 | 9.86 |
| 44909.854166666664 | 9.89 |
| 44909.864583333336 | 9.91 |
| 44909.875 | 9.97 |
| 44909.885416666664 | 10 |
| 44909.895833333336 | 10.06 |
| 44909.90625 | 10.04 |
| 44909.916666666664 | 10.07 |
| 44909.927083333336 | 10.1 |
| 44909.9375 | 10.08 |
| 44909.947916666664 | 10 |
| 44909.958333333336 | 9.99 |
| 44909.96875 | 9.98 |
| 44909.979166666664 | 9.97 |
| 44909.989583333336 | 9.96 |
| 44910.0 | 9.95 |
| 44910.010416666664 | 9.94 |
| 44910.020833333336 | 9.89 |
| 44910.03125 | 9.87 |
| 44910.041666666664 | 9.89 |
| 44910.052083333336 | 9.88 |
| 44910.0625 | 9.87 |
| 44910.072916666664 | 9.84 |
| 44910.083333333336 | 9.81 |
| 44910.09375 | 9.8 |
| 44910.104166666664 | 9.75 |
| 44910.114583333336 | 9.66 |
| 44910.125 | 9.59 |
| 44910.135416666664 | 9.58 |
| 44910.145833333336 | 9.57 |
| 44910.15625 | 9.57 |
| 44910.166666666664 | 9.58 |
| 44910.177083333336 | 9.58 |
| 44910.1875 | 9.57 |
| 44910.197916666664 | 9.56 |
| 44910.208333333336 | 9.54 |
| 44910.21875 | 9.54 |
| 44910.229166666664 | 9.52 |
| 44910.239583333336 | 9.51 |
| 44910.25 | 9.44 |
| 44910.260416666664 | 9.45 |
| 44910.270833333336 | 9.45 |
| 44910.28125 | 9.45 |
| 44910.291666666664 | 9.45 |
| 44910.302083333336 | 9.43 |
| 44910.3125 | 9.4 |
| 44910.322916666664 | 9.38 |
| 44910.333333333336 | 9.36 |
| 44910.34375 | 9.35 |
| 44910.354166666664 | 9.32 |
| 44910.364583333336 | 9.29 |
| 44910.375 | 9.27 |
| 44910.385416666664 | 9.25 |
| 44910.395833333336 | 9.27 |
| 44910.40625 | 9.22 |
| 44910.416666666664 | 9.24 |
| 44910.427083333336 | 9.2 |
| 44910.4375 | 9.3 |
| 44910.447916666664 | 9.37 |
| 44910.458333333336 | 9.4 |
| 44910.46875 | 9.39 |
| 44910.479166666664 | 9.42 |
| 44910.489583333336 | 9.42 |
| 44910.5 | 9.43 |
| 44910.510416666664 | 9.45 |
| 44910.520833333336 | 9.47 |
| 44910.53125 | 9.46 |
| 44910.541666666664 | 9.42 |
| 44910.552083333336 | 9.4 |
| 44910.5625 | 9.42 |
| 44910.572916666664 | 9.42 |
| 44910.583333333336 | 9.42 |
| 44910.59375 | 9.42 |
| 44910.604166666664 | 9.39 |
| 44910.614583333336 | 9.38 |
| 44910.625 | 9.39 |
| 44910.635416666664 | 9.39 |
| 44910.645833333336 | 9.4 |
| 44910.65625 | 9.41 |
| 44910.666666666664 | 9.41 |
| 44910.677083333336 | 9.41 |
| 44910.6875 | 9.41 |
| 44910.697916666664 | 9.41 |
| 44910.708333333336 | 9.41 |
| 44910.71875 | 9.41 |
| 44910.729166666664 | 9.42 |
| 44910.739583333336 | 9.42 |
| 44910.75 | 9.43 |
| 44910.760416666664 | 9.45 |
| 44910.770833333336 | 9.45 |
| 44910.78125 | 9.47 |
| 44910.791666666664 | 9.48 |
| 44910.802083333336 | 9.48 |
| 44910.8125 | 9.56 |
| 44910.822916666664 | 9.56 |
| 44910.833333333336 | 9.55 |
| 44910.84375 | 9.62 |
| 44910.854166666664 | 9.57 |
| 44910.864583333336 | 9.52 |
| 44910.875 | 9.5 |
| 44910.885416666664 | 9.52 |
| 44910.895833333336 | 9.51 |
| 44910.90625 | 9.52 |
| 44910.916666666664 | 9.53 |
| 44910.927083333336 | 9.51 |
| 44910.9375 | 9.51 |
| 44910.947916666664 | 9.5 |
| 44910.958333333336 | 9.51 |
| 44910.96875 | 9.52 |
| 44910.979166666664 | 9.5 |
| 44910.989583333336 | 9.49 |
| 44911.0 | 9.49 |
| 44911.010416666664 | 9.48 |
| 44911.020833333336 | 9.49 |
| 44911.03125 | 9.51 |
| 44911.041666666664 | 9.47 |
| 44911.052083333336 | 9.48 |
| 44911.0625 | 9.5 |
| 44911.072916666664 | 9.52 |
| 44911.083333333336 | 9.51 |
| 44911.09375 | 9.49 |
| 44911.104166666664 | 9.49 |
| 44911.114583333336 | 9.5 |
| 44911.125 | 9.46 |
| 44911.135416666664 | 9.43 |
| 44911.145833333336 | 9.44 |
| 44911.15625 | 9.46 |
| 44911.166666666664 | 9.46 |
| 44911.177083333336 | 9.43 |
| 44911.1875 | 9.43 |
| 44911.197916666664 | 9.43 |
| 44911.208333333336 | 9.4 |
| 44911.21875 | 9.36 |
| 44911.229166666664 | 9.35 |
| 44911.239583333336 | 9.33 |
| 44911.25 | 9.31 |
| 44911.260416666664 | 9.28 |
| 44911.270833333336 | 9.27 |
| 44911.28125 | 9.25 |
| 44911.291666666664 | 9.23 |
| 44911.302083333336 | 9.25 |
| 44911.3125 | 9.24 |
| 44911.322916666664 | 9.24 |
| 44911.333333333336 | 9.23 |
| 44911.34375 | 9.22 |
| 44911.354166666664 | 9.19 |
| 44911.364583333336 | 9.19 |
| 44911.375 | 9.19 |
| 44911.385416666664 | 9.15 |
| 44911.395833333336 | 9.13 |
| 44911.40625 | 9.14 |
| 44911.416666666664 | 9.11 |
| 44911.427083333336 | 9.08 |
| 44911.4375 | 9.08 |
| 44911.447916666664 | 9.05 |
| 44911.458333333336 | 9.06 |
| 44911.46875 | 9.02 |
| 44911.479166666664 | 8.99 |
| 44911.489583333336 | 8.99 |
| 44911.5 | 8.97 |
| 44911.510416666664 | 8.99 |
| 44911.520833333336 | 9 |
| 44911.53125 | 9 |
| 44911.541666666664 | 9.05 |
| 44911.552083333336 | 9.1 |
| 44911.5625 | 9.09 |
| 44911.572916666664 | 9.04 |
| 44911.583333333336 | 9.05 |
| 44911.59375 | 9.06 |
| 44911.604166666664 | 9.08 |
| 44911.614583333336 | 9.09 |
| 44911.625 | 9.12 |
| 44911.635416666664 | 9.14 |
| 44911.645833333336 | 9.17 |
| 44911.65625 | 9.22 |
| 44911.666666666664 | 9.26 |
| 44911.677083333336 | 9.29 |
| 44911.6875 | 9.3 |
| 44911.697916666664 | 9.32 |
| 44911.708333333336 | 9.35 |
| 44911.71875 | 9.36 |
| 44911.729166666664 | 9.39 |
| 44911.739583333336 | 9.41 |
| 44911.75 | 9.44 |
| 44911.760416666664 | 9.46 |
| 44911.770833333336 | 9.48 |
| 44911.78125 | 9.49 |
| 44911.791666666664 | 9.52 |
| 44911.802083333336 | 9.54 |
| 44911.8125 | 9.54 |
| 44911.822916666664 | 9.55 |
| 44911.833333333336 | 9.55 |
| 44911.84375 | 9.57 |
| 44911.854166666664 | 9.55 |
| 44911.864583333336 | 9.57 |
| 44911.875 | 9.62 |
| 44911.885416666664 | 9.63 |
| 44911.895833333336 | 9.68 |
| 44911.90625 | 9.68 |
| 44911.916666666664 | 9.7 |
| 44911.927083333336 | 9.67 |
| 44911.9375 | 9.67 |
| 44911.947916666664 | 9.73 |
| 44911.958333333336 | 9.71 |
| 44911.96875 | 9.7 |
| 44911.979166666664 | 9.67 |
| 44911.989583333336 | 9.65 |
| 44912.0 | 9.62 |
| 44912.010416666664 | 9.64 |
| 44912.020833333336 | 9.64 |
| 44912.03125 | 9.63 |
| 44912.041666666664 | 9.63 |
| 44912.052083333336 | 9.63 |
| 44912.0625 | 9.62 |
| 44912.072916666664 | 9.64 |
| 44912.083333333336 | 9.63 |
| 44912.09375 | 9.56 |
| 44912.104166666664 | 9.54 |
| 44912.114583333336 | 9.53 |
| 44912.125 | 9.52 |
| 44912.135416666664 | 9.5 |
| 44912.145833333336 | 9.5 |
| 44912.15625 | 9.48 |
| 44912.166666666664 | 9.43 |
| 44912.177083333336 | 9.38 |
| 44912.1875 | 9.37 |
| 44912.197916666664 | 9.33 |
| 44912.208333333336 | 9.31 |
| 44912.21875 | 9.29 |
| 44912.229166666664 | 9.28 |
| 44912.239583333336 | 9.28 |
| 44912.25 | 9.29 |
| 44912.260416666664 | 9.27 |
| 44912.270833333336 | 9.25 |
| 44912.28125 | 9.23 |
| 44912.291666666664 | 9.21 |
| 44912.302083333336 | 9.19 |
| 44912.3125 | 9.18 |
| 44912.322916666664 | 9.16 |
| 44912.333333333336 | 9.14 |
| 44912.34375 | 9.12 |
| 44912.354166666664 | 9.12 |
| 44912.364583333336 | 9.14 |
| 44912.375 | 9.15 |
| 44912.385416666664 | 9.11 |
| 44912.395833333336 | 9.11 |
| 44912.40625 | 9.09 |
| 44912.416666666664 | 9.09 |
| 44912.427083333336 | 9.09 |
| 44912.4375 | 9.08 |
| 44912.447916666664 | 9.05 |
| 44912.458333333336 | 9.04 |
| 44912.46875 | 8.95 |
| 44912.479166666664 | 8.93 |
| 44912.489583333336 | 8.9 |
| 44912.5 | 8.83 |
| 44912.510416666664 | 8.81 |
| 44912.520833333336 | 8.97 |
| 44912.53125 | 8.96 |
| 44912.541666666664 | 9.04 |
| 44912.552083333336 | 9.01 |
| 44912.5625 | 9.02 |
| 44912.572916666664 | 9.02 |
| 44912.583333333336 | 9.01 |
| 44912.59375 | 9.02 |
| 44912.604166666664 | 9.06 |
| 44912.614583333336 | 9.01 |
| 44912.625 | 9.04 |
| 44912.635416666664 | 9.06 |
| 44912.645833333336 | 9.05 |
| 44912.65625 | 9.1 |
| 44912.666666666664 | 9.1 |
| 44912.677083333336 | 9.17 |
| 44912.6875 | 9.21 |
| 44912.697916666664 | 9.25 |
| 44912.708333333336 | 9.34 |
| 44912.71875 | 9.38 |
| 44912.729166666664 | 9.4 |
| 44912.739583333336 | 9.43 |
| 44912.75 | 9.44 |
| 44912.760416666664 | 9.46 |
| 44912.770833333336 | 9.48 |
| 44912.78125 | 9.5 |
| 44912.791666666664 | 9.51 |
| 44912.802083333336 | 9.55 |
| 44912.8125 | 9.55 |
| 44912.822916666664 | 9.57 |
| 44912.833333333336 | 9.58 |
| 44912.84375 | 9.6 |
| 44912.854166666664 | 9.56 |
| 44912.864583333336 | 9.56 |
| 44912.875 | 9.59 |
| 44912.885416666664 | 9.65 |
| 44912.895833333336 | 9.7 |
| 44912.90625 | 9.7 |
| 44912.916666666664 | 9.75 |
| 44912.927083333336 | 9.73 |
| 44912.9375 | 9.69 |
| 44912.947916666664 | 9.66 |
| 44912.958333333336 | 9.66 |
| 44912.96875 | 9.78 |
| 44912.979166666664 | 9.76 |
| 44912.989583333336 | 9.71 |
| 44913.0 | 9.72 |
| 44913.010416666664 | 9.73 |
| 44913.020833333336 | 9.74 |
| 44913.03125 | 9.77 |
| 44913.041666666664 | 9.77 |
| 44913.052083333336 | 9.77 |
| 44913.0625 | 9.78 |
| 44913.072916666664 | 9.77 |
| 44913.083333333336 | 9.78 |
| 44913.09375 | 9.76 |
| 44913.104166666664 | 9.77 |
| 44913.114583333336 | 9.7 |
| 44913.125 | 9.68 |
| 44913.135416666664 | 9.68 |
| 44913.145833333336 | 9.65 |
| 44913.15625 | 9.64 |
| 44913.166666666664 | 9.62 |
| 44913.177083333336 | 9.59 |
| 44913.1875 | 9.52 |
| 44913.197916666664 | 9.46 |
| 44913.208333333336 | 9.42 |
| 44913.21875 | 9.39 |
| 44913.229166666664 | 9.37 |
| 44913.239583333336 | 9.35 |
| 44913.25 | 9.33 |
| 44913.260416666664 | 9.31 |
| 44913.270833333336 | 9.29 |
| 44913.28125 | 9.26 |
| 44913.291666666664 | 9.25 |
| 44913.302083333336 | 9.23 |
| 44913.3125 | 9.21 |
| 44913.322916666664 | 9.2 |
| 44913.333333333336 | 9.19 |
| 44913.34375 | 9.17 |
| 44913.354166666664 | 9.15 |
| 44913.364583333336 | 9.13 |
| 44913.375 | 9.11 |
| 44913.385416666664 | 9.09 |
| 44913.395833333336 | 9.07 |
| 44913.40625 | 9.11 |
| 44913.416666666664 | 9.1 |
| 44913.427083333336 | 9.09 |
| 44913.4375 | 9.1 |
| 44913.447916666664 | 9.07 |
| 44913.458333333336 | 9.06 |
| 44913.46875 | 9.03 |
| 44913.479166666664 | 9.01 |
| 44913.489583333336 | 9.01 |
| 44913.5 | 9.02 |
| 44913.510416666664 | 9.07 |
| 44913.520833333336 | 9.1 |
| 44913.53125 | 9.1 |
| 44913.541666666664 | 9.13 |
| 44913.552083333336 | 9.16 |
| 44913.5625 | 9.16 |
| 44913.572916666664 | 9.16 |
| 44913.583333333336 | 9.15 |
| 44913.59375 | 9.17 |
| 44913.604166666664 | 9.18 |
| 44913.614583333336 | 9.19 |
| 44913.625 | 9.21 |
| 44913.635416666664 | 9.24 |
| 44913.645833333336 | 9.24 |
| 44913.65625 | 9.25 |
| 44913.666666666664 | 9.27 |
| 44913.677083333336 | 9.26 |
| 44913.6875 | 9.28 |
| 44913.697916666664 | 9.29 |
| 44913.708333333336 | 9.34 |
| 44913.71875 | 9.4 |
| 44913.729166666664 | 9.46 |
| 44913.739583333336 | 9.52 |
| 44913.75 | 9.55 |
| 44913.760416666664 | 9.58 |
| 44913.770833333336 | 9.61 |
| 44913.78125 | 9.61 |
| 44913.791666666664 | 9.6 |
| 44913.802083333336 | 9.59 |
| 44913.8125 | 9.6 |
| 44913.822916666664 | 9.61 |
| 44913.833333333336 | 9.61 |
| 44913.84375 | 9.62 |
| 44913.854166666664 | 9.63 |
| 44913.864583333336 | 9.64 |
| 44913.875 | 9.64 |
| 44913.885416666664 | 9.64 |
| 44913.895833333336 | 9.63 |
| 44913.90625 | 9.62 |
| 44913.916666666664 | 9.65 |
| 44913.927083333336 | 9.66 |
| 44913.9375 | 9.62 |
| 44913.947916666664 | 9.65 |
| 44913.958333333336 | 9.67 |
| 44913.96875 | 9.66 |
| 44913.979166666664 | 9.67 |
| 44913.989583333336 | 9.65 |
| 44914.0 | 9.62 |
| 44914.010416666664 | 9.63 |
| 44914.020833333336 | 9.63 |
| 44914.03125 | 9.64 |
| 44914.041666666664 | 9.68 |
| 44914.052083333336 | 9.76 |
| 44914.0625 | 9.81 |
| 44914.072916666664 | 9.8 |
| 44914.083333333336 | 9.82 |
| 44914.09375 | 9.83 |
| 44914.104166666664 | 9.85 |
| 44914.114583333336 | 9.85 |
| 44914.125 | 9.84 |
| 44914.135416666664 | 9.82 |
| 44914.145833333336 | 9.8 |
| 44914.15625 | 9.78 |
| 44914.166666666664 | 9.74 |
| 44914.177083333336 | 9.74 |
| 44914.1875 | 9.72 |
| 44914.197916666664 | 9.71 |
| 44914.208333333336 | 9.69 |
| 44914.21875 | 9.65 |
| 44914.229166666664 | 9.61 |
| 44914.239583333336 | 9.59 |
| 44914.25 | 9.55 |
| 44914.260416666664 | 9.52 |
| 44914.270833333336 | 9.5 |
| 44914.28125 | 9.48 |
| 44914.291666666664 | 9.47 |
| 44914.302083333336 | 9.46 |
| 44914.3125 | 9.44 |
| 44914.322916666664 | 9.43 |
| 44914.333333333336 | 9.42 |
| 44914.34375 | 9.41 |
| 44914.354166666664 | 9.41 |
| 44914.364583333336 | 9.41 |
| 44914.375 | 9.39 |
| 44914.385416666664 | 9.39 |
| 44914.395833333336 | 9.39 |
| 44914.40625 | 9.38 |
| 44914.416666666664 | 9.37 |
| 44914.427083333336 | 9.32 |
| 44914.4375 | 9.35 |
| 44914.447916666664 | 9.37 |
| 44914.458333333336 | 9.37 |
| 44914.46875 | 9.39 |
| 44914.479166666664 | 9.36 |
| 44914.489583333336 | 9.32 |
| 44914.5 | 9.32 |
| 44914.510416666664 | 9.3 |
| 44914.520833333336 | 9.29 |
| 44914.53125 | 9.27 |
| 44914.541666666664 | 9.26 |
| 44914.552083333336 | 9.35 |
| 44914.5625 | 9.31 |
| 44914.572916666664 | 9.37 |
| 44914.583333333336 | 9.5 |
| 44914.59375 | 9.52 |
| 44914.604166666664 | 9.56 |
| 44914.614583333336 | 9.62 |
| 44914.625 | 9.67 |
| 44914.635416666664 | 9.73 |
| 44914.645833333336 | 9.77 |
| 44914.65625 | 9.81 |
| 44914.666666666664 | 9.83 |
| 44914.677083333336 | 9.79 |
| 44914.6875 | 9.78 |
| 44914.697916666664 | 9.78 |
| 44914.708333333336 | 9.78 |
| 44914.71875 | 9.77 |
| 44914.729166666664 | 9.75 |
| 44914.739583333336 | 9.73 |
| 44914.75 | 9.8 |
| 44914.760416666664 | 9.86 |
| 44914.770833333336 | 9.91 |
| 44914.78125 | 9.95 |
| 44914.791666666664 | 9.96 |
| 44914.802083333336 | 9.98 |
| 44914.8125 | 9.99 |
| 44914.822916666664 | 9.99 |
| 44914.833333333336 | 9.99 |
| 44914.84375 | 9.99 |
| 44914.854166666664 | 9.99 |
| 44914.864583333336 | 10 |
| 44914.875 | 10 |
| 44914.885416666664 | 10 |
| 44914.895833333336 | 10.01 |
| 44914.90625 | 10.01 |
| 44914.916666666664 | 10 |
| 44914.927083333336 | 9.98 |
| 44914.9375 | 9.98 |
| 44914.947916666664 | 9.98 |
| 44914.958333333336 | 9.96 |
| 44914.96875 | 9.97 |
| 44914.979166666664 | 9.96 |
| 44914.989583333336 | 9.97 |
| 44915.0 | 9.95 |
| 44915.010416666664 | 9.95 |
| 44915.020833333336 | 9.91 |
| 44915.03125 | 9.89 |
| 44915.041666666664 | 9.89 |
| 44915.052083333336 | 9.95 |
| 44915.0625 | 9.98 |
| 44915.072916666664 | 10.01 |
| 44915.083333333336 | 10.02 |
| 44915.09375 | 10.05 |
| 44915.104166666664 | 10.07 |
| 44915.114583333336 | 10.12 |
| 44915.125 | 10.14 |
| 44915.135416666664 | 10.16 |
| 44915.145833333336 | 10.16 |
| 44915.15625 | 10.17 |
| 44915.166666666664 | 10.16 |
| 44915.177083333336 | 10.13 |
| 44915.1875 | 10.11 |
| 44915.197916666664 | 10.07 |
| 44915.208333333336 | 10.04 |
| 44915.21875 | 10.03 |
| 44915.229166666664 | 9.99 |
| 44915.239583333336 | 9.94 |
| 44915.25 | 9.85 |
| 44915.260416666664 | 9.79 |
| 44915.270833333336 | 9.77 |
| 44915.28125 | 9.76 |
| 44915.291666666664 | 9.76 |
| 44915.302083333336 | 9.74 |
| 44915.3125 | 9.72 |
| 44915.322916666664 | 9.69 |
| 44915.333333333336 | 9.67 |
| 44915.34375 | 9.67 |
| 44915.354166666664 | 9.67 |
| 44915.364583333336 | 9.64 |
| 44915.375 | 9.6 |
| 44915.385416666664 | 9.57 |
| 44915.395833333336 | 9.56 |
| 44915.40625 | 9.56 |
| 44915.416666666664 | 9.55 |
| 44915.427083333336 | 9.54 |
| 44915.4375 | 9.54 |
| 44915.447916666664 | 9.54 |
| 44915.458333333336 | 9.52 |
| 44915.46875 | 9.52 |
| 44915.479166666664 | 9.52 |
| 44915.489583333336 | 9.54 |
| 44915.5 | 9.53 |
| 44915.510416666664 | 9.52 |
| 44915.520833333336 | 9.51 |
| 44915.53125 | 9.53 |
| 44915.541666666664 | 9.55 |
| 44915.552083333336 | 9.56 |
| 44915.5625 | 9.57 |
| 44915.572916666664 | 9.57 |
| 44915.583333333336 | 9.6 |
| 44915.59375 | 9.66 |
| 44915.604166666664 | 9.72 |
| 44915.614583333336 | 9.78 |
| 44915.625 | 9.84 |
| 44915.635416666664 | 9.87 |
| 44915.645833333336 | 9.9 |
| 44915.65625 | 9.96 |
| 44915.666666666664 | 10.03 |
| 44915.677083333336 | 10.08 |
| 44915.6875 | 10.13 |
| 44915.697916666664 | 10.16 |
| 44915.708333333336 | 10.19 |
| 44915.71875 | 10.2 |
| 44915.729166666664 | 10.19 |
| 44915.739583333336 | 10.17 |
| 44915.75 | 10.21 |
| 44915.760416666664 | 10.2 |
| 44915.770833333336 | 10.18 |
| 44915.78125 | 10.19 |
| 44915.791666666664 | 10.17 |
| 44915.802083333336 | 10.19 |
| 44915.8125 | 10.23 |
| 44915.822916666664 | 10.27 |
| 44915.833333333336 | 10.28 |
| 44915.84375 | 10.29 |
| 44915.854166666664 | 10.28 |
| 44915.864583333336 | 10.27 |
| 44915.875 | 10.25 |
| 44915.885416666664 | 10.24 |
| 44915.895833333336 | 10.24 |
| 44915.90625 | 10.23 |
| 44915.916666666664 | 10.23 |
| 44915.927083333336 | 10.23 |
| 44915.9375 | 10.23 |
| 44915.947916666664 | 10.22 |
| 44915.958333333336 | 10.21 |
| 44915.96875 | 10.19 |
| 44915.979166666664 | 10.19 |
| 44915.989583333336 | 10.17 |
| 44916.0 | 10.17 |
| 44916.010416666664 | 10.17 |
| 44916.020833333336 | 10.15 |
| 44916.03125 | 10.14 |
| 44916.041666666664 | 10.09 |
| 44916.052083333336 | 10.1 |
| 44916.0625 | 10.07 |
| 44916.072916666664 | 10.04 |
| 44916.083333333336 | 10.04 |
| 44916.09375 | 10.11 |
| 44916.104166666664 | 10.12 |
| 44916.114583333336 | 10.15 |
| 44916.125 | 10.18 |
| 44916.135416666664 | 10.21 |
| 44916.145833333336 | 10.24 |
| 44916.15625 | 10.29 |
| 44916.166666666664 | 10.33 |
| 44916.177083333336 | 10.35 |
| 44916.1875 | 10.33 |
| 44916.197916666664 | 10.34 |
| 44916.208333333336 | 10.34 |
| 44916.21875 | 10.3 |
| 44916.229166666664 | 10.27 |
| 44916.239583333336 | 10.25 |
| 44916.25 | 10.22 |
| 44916.260416666664 | 10.17 |
| 44916.270833333336 | 10.1 |
| 44916.28125 | 10.03 |
| 44916.291666666664 | 9.98 |
| 44916.302083333336 | 9.94 |
| 44916.3125 | 9.9 |
| 44916.322916666664 | 9.87 |
| 44916.333333333336 | 9.85 |
| 44916.34375 | 9.83 |
| 44916.354166666664 | 9.82 |
| 44916.364583333336 | 9.82 |
| 44916.375 | 9.82 |
| 44916.385416666664 | 9.79 |
| 44916.395833333336 | 9.77 |
| 44916.40625 | 9.76 |
| 44916.416666666664 | 9.75 |
| 44916.427083333336 | 9.75 |
| 44916.4375 | 9.76 |
| 44916.447916666664 | 9.78 |
| 44916.458333333336 | 9.79 |
| 44916.46875 | 9.79 |
| 44916.479166666664 | 9.8 |
| 44916.489583333336 | 9.82 |
| 44916.5 | 9.8 |
| 44916.510416666664 | 9.73 |
| 44916.520833333336 | 9.77 |
| 44916.53125 | 9.77 |
| 44916.541666666664 | 9.77 |
| 44916.552083333336 | 9.76 |
| 44916.5625 | 9.77 |
| 44916.572916666664 | 9.77 |
| 44916.583333333336 | 9.78 |
| 44916.59375 | 9.81 |
| 44916.604166666664 | 9.83 |
| 44916.614583333336 | 9.85 |
| 44916.625 | 9.87 |
| 44916.635416666664 | 9.92 |
| 44916.645833333336 | 9.98 |
| 44916.65625 | 10.02 |
| 44916.666666666664 | 10.1 |
| 44916.677083333336 | 10.11 |
| 44916.6875 | 10.12 |
| 44916.697916666664 | 10.16 |
| 44916.708333333336 | 10.21 |
| 44916.71875 | 10.25 |
| 44916.729166666664 | 10.28 |
| 44916.739583333336 | 10.31 |
| 44916.75 | 10.34 |
| 44916.760416666664 | 10.36 |
| 44916.770833333336 | 10.34 |
| 44916.78125 | 10.34 |
| 44916.791666666664 | 10.35 |
| 44916.802083333336 | 10.34 |
| 44916.8125 | 10.33 |
| 44916.822916666664 | 10.34 |
| 44916.833333333336 | 10.35 |
| 44916.84375 | 10.35 |
| 44916.854166666664 | 10.35 |
| 44916.864583333336 | 10.34 |
| 44916.875 | 10.35 |
| 44916.885416666664 | 10.35 |
| 44916.895833333336 | 10.34 |
| 44916.90625 | 10.32 |
| 44916.916666666664 | 10.33 |
| 44916.927083333336 | 10.34 |
| 44916.9375 | 10.35 |
| 44916.947916666664 | 10.35 |
| 44916.958333333336 | 10.34 |
| 44916.96875 | 10.34 |
| 44916.979166666664 | 10.32 |
| 44916.989583333336 | 10.31 |
| 44917.0 | 10.27 |
| 44917.010416666664 | 10.27 |
| 44917.020833333336 | 10.26 |
| 44917.03125 | 10.25 |
| 44917.041666666664 | 10.24 |
| 44917.052083333336 | 10.22 |
| 44917.0625 | 10.21 |
| 44917.072916666664 | 10.19 |
| 44917.083333333336 | 10.16 |
| 44917.09375 | 10.12 |
| 44917.104166666664 | 10.12 |
| 44917.114583333336 | 10.04 |
| 44917.125 | 9.98 |
| 44917.135416666664 | 10 |
| 44917.145833333336 | 9.98 |
| 44917.15625 | 10.07 |
| 44917.166666666664 | 10.14 |
| 44917.177083333336 | 10.14 |
| 44917.1875 | 10.17 |
| 44917.197916666664 | 10.16 |
| 44917.208333333336 | 10.17 |
| 44917.21875 | 10.2 |
| 44917.229166666664 | 10.21 |
| 44917.239583333336 | 10.22 |
| 44917.25 | 10.22 |
| 44917.260416666664 | 10.21 |
| 44917.270833333336 | 10.16 |
| 44917.28125 | 10.16 |
| 44917.291666666664 | 10.14 |
| 44917.302083333336 | 10.12 |
| 44917.3125 | 10.09 |
| 44917.322916666664 | 10.04 |
| 44917.333333333336 | 9.99 |
| 44917.34375 | 9.98 |
| 44917.354166666664 | 9.95 |
| 44917.364583333336 | 9.94 |
| 44917.375 | 9.93 |
| 44917.385416666664 | 9.92 |
| 44917.395833333336 | 9.92 |
| 44917.40625 | 9.93 |
| 44917.416666666664 | 9.93 |
| 44917.427083333336 | 9.92 |
| 44917.4375 | 9.9 |
| 44917.447916666664 | 9.88 |
| 44917.458333333336 | 9.88 |
| 44917.46875 | 9.88 |
| 44917.479166666664 | 9.89 |
| 44917.489583333336 | 9.92 |
| 44917.5 | 9.92 |
| 44917.510416666664 | 9.92 |
| 44917.520833333336 | 9.91 |
| 44917.53125 | 9.9 |
| 44917.541666666664 | 9.87 |
| 44917.552083333336 | 9.86 |
| 44917.5625 | 9.86 |
| 44917.572916666664 | 9.86 |
| 44917.583333333336 | 9.88 |
| 44917.59375 | 9.87 |
| 44917.604166666664 | 9.89 |
| 44917.614583333336 | 9.91 |
| 44917.625 | 9.93 |
| 44917.635416666664 | 9.95 |
| 44917.645833333336 | 9.96 |
| 44917.65625 | 9.97 |
| 44917.666666666664 | 9.96 |
| 44917.677083333336 | 9.95 |
| 44917.6875 | 9.94 |
| 44917.697916666664 | 9.96 |
| 44917.708333333336 | 9.98 |
| 44917.71875 | 10 |
| 44917.729166666664 | 10.04 |
| 44917.739583333336 | 10.05 |
| 44917.75 | 10.07 |
| 44917.760416666664 | 10.07 |
| 44917.770833333336 | 10.08 |
| 44917.78125 | 10.1 |
| 44917.791666666664 | 10.1 |
| 44917.802083333336 | 10.12 |
| 44917.8125 | 10.12 |
| 44917.822916666664 | 10.09 |
| 44917.833333333336 | 10.08 |
| 44917.84375 | 10.06 |
| 44917.854166666664 | 10.04 |
| 44917.864583333336 | 10.03 |
| 44917.875 | 10.02 |
| 44917.885416666664 | 9.99 |
| 44917.895833333336 | 9.97 |
| 44917.90625 | 9.95 |
| 44917.916666666664 | 9.93 |
| 44917.927083333336 | 9.92 |
| 44917.9375 | 9.91 |
| 44917.947916666664 | 9.9 |
| 44917.958333333336 | 9.91 |
| 44917.96875 | 9.9 |
| 44917.979166666664 | 9.91 |
| 44917.989583333336 | 9.91 |
| 44918.0 | 9.91 |
| 44918.010416666664 | 9.9 |
| 44918.020833333336 | 9.9 |
| 44918.03125 | 9.89 |
| 44918.041666666664 | 9.88 |
| 44918.052083333336 | 9.88 |
| 44918.0625 | 9.82 |
| 44918.072916666664 | 9.83 |
| 44918.083333333336 | 9.81 |
| 44918.09375 | 9.82 |
| 44918.104166666664 | 9.79 |
| 44918.114583333336 | 9.76 |
| 44918.125 | 9.73 |
| 44918.135416666664 | 9.65 |
| 44918.145833333336 | 9.6 |
| 44918.15625 | 9.57 |
| 44918.166666666664 | 9.54 |
| 44918.177083333336 | 9.5 |
| 44918.1875 | 9.5 |
| 44918.197916666664 | 9.37 |
| 44918.208333333336 | 9.34 |
| 44918.21875 | 9.35 |
| 44918.229166666664 | 9.38 |
| 44918.239583333336 | 9.35 |
| 44918.25 | 9.34 |
| 44918.260416666664 | 9.35 |
| 44918.270833333336 | 9.35 |
| 44918.28125 | 9.36 |
| 44918.291666666664 | 9.36 |
| 44918.302083333336 | 9.38 |
| 44918.3125 | 9.34 |
| 44918.322916666664 | 9.35 |
| 44918.333333333336 | 9.36 |
| 44918.34375 | 9.35 |
| 44918.354166666664 | 9.36 |
| 44918.364583333336 | 9.38 |
| 44918.375 | 9.37 |
| 44918.385416666664 | 9.37 |
| 44918.395833333336 | 9.36 |
| 44918.40625 | 9.34 |
| 44918.416666666664 | 9.34 |
| 44918.427083333336 | 9.37 |
| 44918.4375 | 9.39 |
| 44918.447916666664 | 9.41 |
| 44918.458333333336 | 9.41 |
| 44918.46875 | 9.41 |
| 44918.479166666664 | 9.42 |
| 44918.489583333336 | 9.41 |
| 44918.5 | 9.41 |
| 44918.510416666664 | 9.41 |
| 44918.520833333336 | 9.41 |
| 44918.53125 | 9.41 |
| 44918.541666666664 | 9.4 |
| 44918.552083333336 | 9.4 |
| 44918.5625 | 9.4 |
| 44918.572916666664 | 9.39 |
| 44918.583333333336 | 9.37 |
| 44918.59375 | 9.39 |
| 44918.604166666664 | 9.38 |
| 44918.614583333336 | 9.39 |
| 44918.625 | 9.41 |
| 44918.635416666664 | 9.42 |
| 44918.645833333336 | 9.42 |
| 44918.65625 | 9.42 |
| 44918.666666666664 | 9.43 |
| 44918.677083333336 | 9.42 |
| 44918.6875 | 9.43 |
| 44918.697916666664 | 9.45 |
| 44918.708333333336 | 9.45 |
| 44918.71875 | 9.47 |
| 44918.729166666664 | 9.48 |
| 44918.739583333336 | 9.48 |
| 44918.75 | 9.49 |
| 44918.760416666664 | 9.5 |
| 44918.770833333336 | 9.48 |
| 44918.78125 | 9.46 |
| 44918.791666666664 | 9.44 |
| 44918.802083333336 | 9.42 |
| 44918.8125 | 9.42 |
| 44918.822916666664 | 9.41 |
| 44918.833333333336 | 9.4 |
| 44918.84375 | 9.43 |
| 44918.854166666664 | 9.42 |
| 44918.864583333336 | 9.41 |
| 44918.875 | 9.39 |
| 44918.885416666664 | 9.36 |
| 44918.895833333336 | 9.36 |
| 44918.90625 | 9.37 |
| 44918.916666666664 | 9.37 |
| 44918.927083333336 | 9.37 |
| 44918.9375 | 9.41 |
| 44918.947916666664 | 9.45 |
| 44918.958333333336 | 9.5 |
| 44918.96875 | 9.53 |
| 44918.979166666664 | 9.53 |
| 44918.989583333336 | 9.57 |
| 44919.0 | 9.6 |
| 44919.010416666664 | 9.6 |
| 44919.020833333336 | 9.6 |
| 44919.03125 | 9.59 |
| 44919.041666666664 | 9.56 |
| 44919.052083333336 | 9.53 |
| 44919.0625 | 9.51 |
| 44919.072916666664 | 9.51 |
| 44919.083333333336 | 9.46 |
| 44919.09375 | 9.54 |
| 44919.104166666664 | 9.6 |
| 44919.114583333336 | 9.63 |
| 44919.125 | 9.65 |
| 44919.135416666664 | 9.63 |
| 44919.145833333336 | 9.66 |
| 44919.15625 | 9.66 |
| 44919.166666666664 | 9.77 |
| 44919.177083333336 | 9.74 |
| 44919.1875 | 9.69 |
| 44919.197916666664 | 9.75 |
| 44919.208333333336 | 9.84 |
| 44919.21875 | 9.93 |
| 44919.229166666664 | 9.94 |
| 44919.239583333336 | 9.97 |
| 44919.25 | 10.03 |
| 44919.260416666664 | 10.07 |
| 44919.270833333336 | 10.09 |
| 44919.28125 | 10.08 |
| 44919.291666666664 | 10.09 |
| 44919.302083333336 | 10.1 |
| 44919.3125 | 10.06 |
| 44919.322916666664 | 10.09 |
| 44919.333333333336 | 10.08 |
| 44919.34375 | 10.06 |
| 44919.354166666664 | 10.06 |
| 44919.364583333336 | 10.03 |
| 44919.375 | 10.03 |
| 44919.385416666664 | 10.07 |
| 44919.395833333336 | 10.08 |
| 44919.40625 | 10.15 |
| 44919.416666666664 | 10.22 |
| 44919.427083333336 | 10.39 |
| 44919.4375 | 10.62 |
| 44919.447916666664 | 10.75 |
| 44919.458333333336 | 10.88 |
| 44919.46875 | 10.92 |
| 44919.479166666664 | 10.81 |
| 44919.489583333336 | 10.7 |
| 44919.5 | 10.58 |
| 44919.510416666664 | 10.47 |
| 44919.520833333336 | 10.37 |
| 44919.53125 | 10.29 |
| 44919.541666666664 | 10.26 |
| 44919.552083333336 | 10.25 |
| 44919.5625 | 10.23 |
| 44919.572916666664 | 10.21 |
| 44919.583333333336 | 10.19 |
| 44919.59375 | 10.18 |
| 44919.604166666664 | 10.17 |
| 44919.614583333336 | 10.23 |
| 44919.625 | 10.21 |
| 44919.635416666664 | 10.31 |
| 44919.645833333336 | 10.41 |
| 44919.65625 | 10.57 |
| 44919.666666666664 | 10.7 |
| 44919.677083333336 | 10.74 |
| 44919.6875 | 10.75 |
| 44919.697916666664 | 10.78 |
| 44919.708333333336 | 10.87 |
| 44919.71875 | 10.93 |
| 44919.729166666664 | 10.89 |
| 44919.739583333336 | 10.99 |
| 44919.75 | 11 |
| 44919.760416666664 | 10.99 |
| 44919.770833333336 | 11.01 |
| 44919.78125 | 11.01 |
| 44919.791666666664 | 11.03 |
| 44919.802083333336 | 11.04 |
| 44919.8125 | 11.07 |
| 44919.822916666664 | 11.06 |
| 44919.833333333336 | 11.1 |
| 44919.84375 | 11.12 |
| 44919.854166666664 | 11.09 |
| 44919.864583333336 | 11.11 |
| 44919.875 | 11.1 |
| 44919.885416666664 | 11.14 |
| 44919.895833333336 | 11.12 |
| 44919.90625 | 11.09 |
| 44919.916666666664 | 11.08 |
| 44919.927083333336 | 11.08 |
| 44919.9375 | 11.08 |
| 44919.947916666664 | 11.07 |
| 44919.958333333336 | 11.1 |
| 44919.96875 | 11.16 |
| 44919.979166666664 | 11.23 |
| 44919.989583333336 | 11.23 |
| 44920.0 | 11.3 |
| 44920.010416666664 | 11.27 |
| 44920.020833333336 | 11.24 |
| 44920.03125 | 11.16 |
| 44920.041666666664 | 11.07 |
| 44920.052083333336 | 11 |
| 44920.0625 | 10.92 |
| 44920.072916666664 | 10.86 |
| 44920.083333333336 | 10.83 |
| 44920.09375 | 10.81 |
| 44920.104166666664 | 10.8 |
| 44920.114583333336 | 10.8 |
| 44920.125 | 10.83 |
| 44920.135416666664 | 10.84 |
| 44920.145833333336 | 10.92 |
| 44920.15625 | 10.85 |
| 44920.166666666664 | 10.86 |
| 44920.177083333336 | 10.94 |
| 44920.1875 | 11.05 |
| 44920.197916666664 | 11.19 |
| 44920.208333333336 | 11.25 |
| 44920.21875 | 11.25 |
| 44920.229166666664 | 11.22 |
| 44920.239583333336 | 11.2 |
| 44920.25 | 11.17 |
| 44920.260416666664 | 11.16 |
| 44920.270833333336 | 11.13 |
| 44920.28125 | 11.13 |
| 44920.291666666664 | 11.16 |
| 44920.302083333336 | 11.12 |
| 44920.3125 | 11.15 |
| 44920.322916666664 | 11.1 |
| 44920.333333333336 | 11.14 |
| 44920.34375 | 11.15 |
| 44920.354166666664 | 11.11 |
| 44920.364583333336 | 11.16 |
| 44920.375 | 11.16 |
| 44920.385416666664 | 11.12 |
| 44920.395833333336 | 11.11 |
| 44920.40625 | 11.11 |
| 44920.416666666664 | 11.12 |
| 44920.427083333336 | 11.11 |
| 44920.4375 | 11.1 |
| 44920.447916666664 | 11.1 |
| 44920.458333333336 | 11.12 |
| 44920.46875 | 11.14 |
| 44920.479166666664 | 11.13 |
| 44920.489583333336 | 11.1 |
| 44920.5 | 11.04 |
| 44920.510416666664 | 10.95 |
| 44920.520833333336 | 10.86 |
| 44920.53125 | 10.82 |
| 44920.541666666664 | 10.75 |
| 44920.552083333336 | 10.73 |
| 44920.5625 | 10.71 |
| 44920.572916666664 | 10.73 |
| 44920.583333333336 | 10.79 |
| 44920.59375 | 10.86 |
| 44920.604166666664 | 10.89 |
| 44920.614583333336 | 10.9 |
| 44920.625 | 10.89 |
| 44920.635416666664 | 10.9 |
| 44920.645833333336 | 10.8 |
| 44920.65625 | 10.89 |
| 44920.666666666664 | 10.9 |
| 44920.677083333336 | 10.88 |
| 44920.6875 | 10.92 |
| 44920.697916666664 | 10.93 |
| 44920.708333333336 | 10.94 |
| 44920.71875 | 10.97 |
| 44920.729166666664 | 11.01 |
| 44920.739583333336 | 11 |
| 44920.75 | 11.1 |
| 44920.760416666664 | 11.13 |
| 44920.770833333336 | 11.15 |
| 44920.78125 | 11.14 |
| 44920.791666666664 | 11.13 |
| 44920.802083333336 | 11.17 |
| 44920.8125 | 11.18 |
| 44920.822916666664 | 11.22 |
| 44920.833333333336 | 11.24 |
| 44920.84375 | 11.25 |
| 44920.854166666664 | 11.22 |
| 44920.864583333336 | 11.25 |
| 44920.875 | 11.24 |
| 44920.885416666664 | 11.21 |
| 44920.895833333336 | 11.21 |
| 44920.90625 | 11.27 |
| 44920.916666666664 | 11.24 |
| 44920.927083333336 | 11.24 |
| 44920.9375 | 11.23 |
| 44920.947916666664 | 11.24 |
| 44920.958333333336 | 11.24 |
| 44920.96875 | 11.25 |
| 44920.979166666664 | 11.24 |
| 44920.989583333336 | 11.24 |
| 44921.0 | 11.28 |
| 44921.010416666664 | 11.31 |
| 44921.020833333336 | 11.34 |
| 44921.03125 | 11.34 |
| 44921.041666666664 | 11.34 |
| 44921.052083333336 | 11.33 |
| 44921.0625 | 11.32 |
| 44921.072916666664 | 11.29 |
| 44921.083333333336 | 11.25 |
| 44921.09375 | 11.2 |
| 44921.104166666664 | 11.15 |
| 44921.114583333336 | 11.11 |
| 44921.125 | 11.09 |
| 44921.135416666664 | 11.07 |
| 44921.145833333336 | 11.02 |
| 44921.15625 | 11.04 |
| 44921.166666666664 | 11.03 |
| 44921.177083333336 | 11.1 |
| 44921.1875 | 11.11 |
| 44921.197916666664 | 11.11 |
| 44921.208333333336 | 11.11 |
| 44921.21875 | 11.11 |
| 44921.229166666664 | 11.15 |
| 44921.239583333336 | 11.17 |
| 44921.25 | 11.24 |
| 44921.260416666664 | 11.25 |
| 44921.270833333336 | 11.22 |
| 44921.28125 | 11.18 |
| 44921.291666666664 | 11.14 |
| 44921.302083333336 | 11.12 |
| 44921.3125 | 11.1 |
| 44921.322916666664 | 11.07 |
| 44921.333333333336 | 11.08 |
| 44921.34375 | 11.08 |
| 44921.354166666664 | 11.04 |
| 44921.364583333336 | 11.07 |
| 44921.375 | 11.04 |
| 44921.385416666664 | 11.09 |
| 44921.395833333336 | 11.07 |
| 44921.40625 | 11.06 |
| 44921.416666666664 | 11.06 |
| 44921.427083333336 | 11.06 |
| 44921.4375 | 11.06 |
| 44921.447916666664 | 11.07 |
| 44921.458333333336 | 11.08 |
| 44921.46875 | 11.09 |
| 44921.479166666664 | 11.1 |
| 44921.489583333336 | 11.13 |
| 44921.5 | 11.13 |
| 44921.510416666664 | 11.13 |
| 44921.520833333336 | 11.12 |
| 44921.53125 | 11.1 |
| 44921.541666666664 | 11.1 |
| 44921.552083333336 | 11.07 |
| 44921.5625 | 11.02 |
| 44921.572916666664 | 11 |
| 44921.583333333336 | 10.97 |
| 44921.59375 | 10.96 |
| 44921.604166666664 | 10.97 |
| 44921.614583333336 | 11 |
| 44921.625 | 11.04 |
| 44921.635416666664 | 11.06 |
| 44921.645833333336 | 11.08 |
| 44921.65625 | 11.1 |
| 44921.666666666664 | 11.1 |
| 44921.677083333336 | 11.05 |
| 44921.6875 | 11.07 |
| 44921.697916666664 | 11.1 |
| 44921.708333333336 | 11.1 |
| 44921.71875 | 11.12 |
| 44921.729166666664 | 11.15 |
| 44921.739583333336 | 11.16 |
| 44921.75 | 11.18 |
| 44921.760416666664 | 11.18 |
| 44921.770833333336 | 11.21 |
| 44921.78125 | 11.25 |
| 44921.791666666664 | 11.28 |
| 44921.802083333336 | 11.27 |
| 44921.8125 | 11.26 |
| 44921.822916666664 | 11.24 |
| 44921.833333333336 | 11.23 |
| 44921.84375 | 11.24 |
| 44921.854166666664 | 11.26 |
| 44921.864583333336 | 11.27 |
| 44921.875 | 11.3 |
| 44921.885416666664 | 11.32 |
| 44921.895833333336 | 11.32 |
| 44921.90625 | 11.3 |
| 44921.916666666664 | 11.27 |
| 44921.927083333336 | 11.29 |
| 44921.9375 | 11.29 |
| 44921.947916666664 | 11.28 |
| 44921.958333333336 | 11.28 |
| 44921.96875 | 11.28 |
| 44921.979166666664 | 11.27 |
| 44921.989583333336 | 11.26 |
| 44922.0 | 11.27 |
| 44922.010416666664 | 11.27 |
| 44922.020833333336 | 11.26 |
| 44922.03125 | 11.27 |
| 44922.041666666664 | 11.28 |
| 44922.052083333336 | 11.28 |
| 44922.0625 | 11.29 |
| 44922.072916666664 | 11.29 |
| 44922.083333333336 | 11.3 |
| 44922.09375 | 11.31 |
| 44922.104166666664 | 11.31 |
| 44922.114583333336 | 11.3 |
| 44922.125 | 11.28 |
| 44922.135416666664 | 11.26 |
| 44922.145833333336 | 11.23 |
| 44922.15625 | 11.19 |
| 44922.166666666664 | 11.18 |
| 44922.177083333336 | 11.16 |
| 44922.1875 | 11.13 |
| 44922.197916666664 | 11.15 |
| 44922.208333333336 | 11.16 |
| 44922.21875 | 11.17 |
| 44922.229166666664 | 11.17 |
| 44922.239583333336 | 11.15 |
| 44922.25 | 11.14 |
| 44922.260416666664 | 11.13 |
| 44922.270833333336 | 11.13 |
| 44922.28125 | 11.18 |
| 44922.291666666664 | 11.17 |
| 44922.302083333336 | 11.16 |
| 44922.3125 | 11.15 |
| 44922.322916666664 | 11.11 |
| 44922.333333333336 | 11.1 |
| 44922.34375 | 11.08 |
| 44922.354166666664 | 11.07 |
| 44922.364583333336 | 11.05 |
| 44922.375 | 11.02 |
| 44922.385416666664 | 11.05 |
| 44922.395833333336 | 11 |
| 44922.40625 | 10.99 |
| 44922.416666666664 | 10.96 |
| 44922.427083333336 | 11 |
| 44922.4375 | 11 |
| 44922.447916666664 | 10.99 |
| 44922.458333333336 | 11.01 |
| 44922.46875 | 11.01 |
| 44922.479166666664 | 11.02 |
| 44922.489583333336 | 11.01 |
| 44922.5 | 11.01 |
| 44922.510416666664 | 11.01 |
| 44922.520833333336 | 11.01 |
| 44922.53125 | 11.01 |
| 44922.541666666664 | 11.02 |
| 44922.552083333336 | 11.03 |
| 44922.5625 | 11.04 |
| 44922.572916666664 | 11.05 |
| 44922.583333333336 | 11.06 |
| 44922.59375 | 11.06 |
| 44922.604166666664 | 11.08 |
| 44922.614583333336 | 11.1 |
| 44922.625 | 11.08 |
| 44922.635416666664 | 11.06 |
| 44922.645833333336 | 11.08 |
| 44922.65625 | 11.11 |
| 44922.666666666664 | 11.15 |
| 44922.677083333336 | 11.18 |
| 44922.6875 | 11.19 |
| 44922.697916666664 | 11.2 |
| 44922.708333333336 | 11.21 |
| 44922.71875 | 11.15 |
| 44922.729166666664 | 11.17 |
| 44922.739583333336 | 11.22 |
| 44922.75 | 11.25 |
| 44922.760416666664 | 11.29 |
| 44922.770833333336 | 11.31 |
| 44922.78125 | 11.33 |
| 44922.791666666664 | 11.34 |
| 44922.802083333336 | 11.35 |
| 44922.8125 | 11.38 |
| 44922.822916666664 | 11.4 |
| 44922.833333333336 | 11.46 |
| 44922.84375 | 11.48 |
| 44922.854166666664 | 11.5 |
| 44922.864583333336 | 11.44 |
| 44922.875 | 11.39 |
| 44922.885416666664 | 11.4 |
| 44922.895833333336 | 11.41 |
| 44922.90625 | 11.44 |
| 44922.916666666664 | 11.46 |
| 44922.927083333336 | 11.45 |
| 44922.9375 | 11.48 |
| 44922.947916666664 | 11.48 |
| 44922.958333333336 | 11.47 |
| 44922.96875 | 11.48 |
| 44922.979166666664 | 11.45 |
| 44922.989583333336 | 11.43 |
| 44923.0 | 11.42 |
| 44923.010416666664 | 11.4 |
| 44923.020833333336 | 11.37 |
| 44923.03125 | 11.36 |
| 44923.041666666664 | 11.35 |
| 44923.052083333336 | 11.34 |
| 44923.0625 | 11.33 |
| 44923.072916666664 | 11.32 |
| 44923.083333333336 | 11.29 |
| 44923.09375 | 11.28 |
| 44923.104166666664 | 11.27 |
| 44923.114583333336 | 11.27 |
| 44923.125 | 11.27 |
| 44923.135416666664 | 11.29 |
| 44923.145833333336 | 11.3 |
| 44923.15625 | 11.3 |
| 44923.166666666664 | 11.29 |
| 44923.177083333336 | 11.28 |
| 44923.1875 | 11.27 |
| 44923.197916666664 | 11.25 |
| 44923.208333333336 | 11.24 |
| 44923.21875 | 11.19 |
| 44923.229166666664 | 11.21 |
| 44923.239583333336 | 11.2 |
| 44923.25 | 11.2 |
| 44923.260416666664 | 11.19 |
| 44923.270833333336 | 11.19 |
| 44923.28125 | 11.17 |
| 44923.291666666664 | 11.16 |
| 44923.302083333336 | 11.14 |
| 44923.3125 | 11.11 |
| 44923.322916666664 | 11.13 |
| 44923.333333333336 | 11.11 |
| 44923.34375 | 11.08 |
| 44923.354166666664 | 11.1 |
| 44923.364583333336 | 11.08 |
| 44923.375 | 11.08 |
| 44923.385416666664 | 11.08 |
| 44923.395833333336 | 11.09 |
| 44923.40625 | 11.1 |
| 44923.416666666664 | 11.09 |
| 44923.427083333336 | 11.07 |
| 44923.4375 | 11.08 |
| 44923.447916666664 | 11.07 |
| 44923.458333333336 | 11.02 |
| 44923.46875 | 11.04 |
| 44923.479166666664 | 11.04 |
| 44923.489583333336 | 11.02 |
| 44923.5 | 11.05 |
| 44923.510416666664 | 11.05 |
| 44923.520833333336 | 11.05 |
| 44923.53125 | 11.04 |
| 44923.541666666664 | 11.04 |
| 44923.552083333336 | 11.05 |
| 44923.5625 | 11.05 |
| 44923.572916666664 | 11.06 |
| 44923.583333333336 | 11.07 |
| 44923.59375 | 11.09 |
| 44923.604166666664 | 11.12 |
| 44923.614583333336 | 11.13 |
| 44923.625 | 11.15 |
| 44923.635416666664 | 11.18 |
| 44923.645833333336 | 11.21 |
| 44923.65625 | 11.24 |
| 44923.666666666664 | 11.26 |
| 44923.677083333336 | 11.27 |
| 44923.6875 | 11.28 |
| 44923.697916666664 | 11.29 |
| 44923.708333333336 | 11.3 |
| 44923.71875 | 11.32 |
| 44923.729166666664 | 11.34 |
| 44923.739583333336 | 11.34 |
| 44923.75 | 11.34 |
| 44923.760416666664 | 11.35 |
| 44923.770833333336 | 11.38 |
| 44923.78125 | 11.41 |
| 44923.791666666664 | 11.44 |
| 44923.802083333336 | 11.47 |
| 44923.8125 | 11.47 |
| 44923.822916666664 | 11.49 |
| 44923.833333333336 | 11.54 |
| 44923.84375 | 11.57 |
| 44923.854166666664 | 11.6 |
| 44923.864583333336 | 11.61 |
| 44923.875 | 11.61 |
| 44923.885416666664 | 11.57 |
| 44923.895833333336 | 11.53 |
| 44923.90625 | 11.54 |
| 44923.916666666664 | 11.53 |
| 44923.927083333336 | 11.52 |
| 44923.9375 | 11.53 |
| 44923.947916666664 | 11.53 |
| 44923.958333333336 | 11.54 |
| 44923.96875 | 11.55 |
| 44923.979166666664 | 11.55 |
| 44923.989583333336 | 11.52 |
| 44924.0 | 11.53 |
| 44924.010416666664 | 11.52 |
| 44924.020833333336 | 11.48 |
| 44924.03125 | 11.48 |
| 44924.041666666664 | 11.47 |
| 44924.052083333336 | 11.44 |
| 44924.0625 | 11.42 |
| 44924.072916666664 | 11.41 |
| 44924.083333333336 | 11.41 |
| 44924.09375 | 11.39 |
| 44924.104166666664 | 11.37 |
| 44924.114583333336 | 11.35 |
| 44924.125 | 11.33 |
| 44924.135416666664 | 11.32 |
| 44924.145833333336 | 11.31 |
| 44924.15625 | 11.3 |
| 44924.166666666664 | 11.31 |
| 44924.177083333336 | 11.31 |
| 44924.1875 | 11.33 |
| 44924.197916666664 | 11.32 |
| 44924.208333333336 | 11.31 |
| 44924.21875 | 11.3 |
| 44924.229166666664 | 11.29 |
| 44924.239583333336 | 11.28 |
| 44924.25 | 11.27 |
| 44924.260416666664 | 11.25 |
| 44924.270833333336 | 11.2 |
| 44924.28125 | 11.24 |
| 44924.291666666664 | 11.23 |
| 44924.302083333336 | 11.2 |
| 44924.3125 | 11.18 |
| 44924.322916666664 | 11.15 |
| 44924.333333333336 | 11.13 |
| 44924.34375 | 11.12 |
| 44924.354166666664 | 11.09 |
| 44924.364583333336 | 11.07 |
| 44924.375 | 11.02 |
| 44924.385416666664 | 11.02 |
| 44924.395833333336 | 11.04 |
| 44924.40625 | 11.03 |
| 44924.416666666664 | 11.02 |
| 44924.427083333336 | 11.02 |
| 44924.4375 | 11.01 |
| 44924.447916666664 | 11.01 |
| 44924.458333333336 | 11 |
| 44924.46875 | 11 |
| 44924.479166666664 | 10.99 |
| 44924.489583333336 | 11 |
| 44924.5 | 10.95 |
| 44924.510416666664 | 10.91 |
| 44924.520833333336 | 10.94 |
| 44924.53125 | 10.94 |
| 44924.541666666664 | 10.96 |
| 44924.552083333336 | 10.99 |
| 44924.5625 | 11 |
| 44924.572916666664 | 11 |
| 44924.583333333336 | 11.02 |
| 44924.59375 | 11.03 |
| 44924.604166666664 | 11.06 |
| 44924.614583333336 | 11.1 |
| 44924.625 | 11.12 |
| 44924.635416666664 | 11.16 |
| 44924.645833333336 | 11.18 |
| 44924.65625 | 11.23 |
| 44924.666666666664 | 11.27 |
| 44924.677083333336 | 11.3 |
| 44924.6875 | 11.34 |
| 44924.697916666664 | 11.38 |
| 44924.708333333336 | 11.43 |
| 44924.71875 | 11.43 |
| 44924.729166666664 | 11.45 |
| 44924.739583333336 | 11.47 |
| 44924.75 | 11.44 |
| 44924.760416666664 | 11.46 |
| 44924.770833333336 | 11.51 |
| 44924.78125 | 11.52 |
| 44924.791666666664 | 11.49 |
| 44924.802083333336 | 11.5 |
| 44924.8125 | 11.51 |
| 44924.822916666664 | 11.53 |
| 44924.833333333336 | 11.54 |
| 44924.84375 | 11.6 |
| 44924.854166666664 | 11.61 |
| 44924.864583333336 | 11.62 |
| 44924.875 | 11.64 |
| 44924.885416666664 | 11.64 |
| 44924.895833333336 | 11.64 |
| 44924.90625 | 11.6 |
| 44924.916666666664 | 11.51 |
| 44924.927083333336 | 11.51 |
| 44924.9375 | 11.5 |
| 44924.947916666664 | 11.48 |
| 44924.958333333336 | 11.5 |
| 44924.96875 | 11.52 |
| 44924.979166666664 | 11.53 |
| 44924.989583333336 | 11.53 |
| 44925.0 | 11.54 |
| 44925.010416666664 | 11.5 |
| 44925.020833333336 | 11.46 |
| 44925.03125 | 11.46 |
| 44925.041666666664 | 11.45 |
| 44925.052083333336 | 11.41 |
| 44925.0625 | 11.39 |
| 44925.072916666664 | 11.42 |
| 44925.083333333336 | 11.42 |
| 44925.09375 | 11.39 |
| 44925.104166666664 | 11.36 |
| 44925.114583333336 | 11.32 |
| 44925.125 | 11.3 |
| 44925.135416666664 | 11.28 |
| 44925.145833333336 | 11.25 |
| 44925.15625 | 11.2 |
| 44925.166666666664 | 11.18 |
| 44925.177083333336 | 11.17 |
| 44925.1875 | 11.17 |
| 44925.197916666664 | 11.17 |
| 44925.208333333336 | 11.18 |
| 44925.21875 | 11.2 |
| 44925.229166666664 | 11.22 |
| 44925.239583333336 | 11.24 |
| 44925.25 | 11.24 |
| 44925.260416666664 | 11.24 |
| 44925.270833333336 | 11.24 |
| 44925.28125 | 11.23 |
| 44925.291666666664 | 11.23 |
| 44925.302083333336 | 11.23 |
| 44925.3125 | 11.12 |
| 44925.322916666664 | 11.17 |
| 44925.333333333336 | 11.17 |
| 44925.34375 | 11.13 |
| 44925.354166666664 | 11.1 |
| 44925.364583333336 | 11.07 |
| 44925.375 | 11 |
| 44925.385416666664 | 11 |
| 44925.395833333336 | 10.98 |
| 44925.40625 | 10.92 |
| 44925.416666666664 | 10.84 |
| 44925.427083333336 | 10.85 |
| 44925.4375 | 10.86 |
| 44925.447916666664 | 10.83 |
| 44925.458333333336 | 10.82 |
| 44925.46875 | 10.81 |
| 44925.479166666664 | 10.79 |
| 44925.489583333336 | 10.8 |
| 44925.5 | 10.78 |
| 44925.510416666664 | 10.77 |
| 44925.520833333336 | 10.73 |
| 44925.53125 | 10.74 |
| 44925.541666666664 | 10.71 |
| 44925.552083333336 | 10.73 |
| 44925.5625 | 10.76 |
| 44925.572916666664 | 10.77 |
| 44925.583333333336 | 10.83 |
| 44925.59375 | 10.83 |
| 44925.604166666664 | 10.85 |
| 44925.614583333336 | 10.88 |
| 44925.625 | 10.93 |
| 44925.635416666664 | 11 |
| 44925.645833333336 | 11.06 |
| 44925.65625 | 11.11 |
| 44925.666666666664 | 11.15 |
| 44925.677083333336 | 11.2 |
| 44925.6875 | 11.23 |
| 44925.697916666664 | 11.28 |
| 44925.708333333336 | 11.33 |
| 44925.71875 | 11.38 |
| 44925.729166666664 | 11.42 |
| 44925.739583333336 | 11.45 |
| 44925.75 | 11.47 |
| 44925.760416666664 | 11.49 |
| 44925.770833333336 | 11.51 |
| 44925.78125 | 11.49 |
| 44925.791666666664 | 11.51 |
| 44925.802083333336 | 11.49 |
| 44925.8125 | 11.5 |
| 44925.822916666664 | 11.54 |
| 44925.833333333336 | 11.61 |
| 44925.84375 | 11.56 |
| 44925.854166666664 | 11.62 |
| 44925.864583333336 | 11.63 |
| 44925.875 | 11.63 |
| 44925.885416666664 | 11.65 |
| 44925.895833333336 | 11.64 |
| 44925.90625 | 11.62 |
| 44925.916666666664 | 11.61 |
| 44925.927083333336 | 11.6 |
| 44925.9375 | 11.59 |
| 44925.947916666664 | 11.54 |
| 44925.958333333336 | 11.49 |
| 44925.96875 | 11.46 |
| 44925.979166666664 | 11.45 |
| 44925.989583333336 | 11.45 |
| 44926.0 | 11.45 |
| 44926.010416666664 | 11.44 |
| 44926.020833333336 | 11.45 |
| 44926.03125 | 11.44 |
| 44926.041666666664 | 11.43 |
| 44926.052083333336 | 11.4 |
| 44926.0625 | 11.37 |
| 44926.072916666664 | 11.4 |
| 44926.083333333336 | 11.37 |
| 44926.09375 | 11.33 |
| 44926.104166666664 | 11.33 |
| 44926.114583333336 | 11.31 |
| 44926.125 | 11.3 |
| 44926.135416666664 | 11.27 |
| 44926.145833333336 | 11.24 |
| 44926.15625 | 11.21 |
| 44926.166666666664 | 11.18 |
| 44926.177083333336 | 11.14 |
| 44926.1875 | 11.1 |
| 44926.197916666664 | 11.08 |
| 44926.208333333336 | 11.07 |
| 44926.21875 | 11.07 |
| 44926.229166666664 | 11.07 |
| 44926.239583333336 | 11.07 |
| 44926.25 | 11.06 |
| 44926.260416666664 | 11.06 |
| 44926.270833333336 | 11.06 |
| 44926.28125 | 11.06 |
| 44926.291666666664 | 11.05 |
| 44926.302083333336 | 11.05 |
| 44926.3125 | 11.04 |
| 44926.322916666664 | 11.04 |
| 44926.333333333336 | 11.03 |
| 44926.34375 | 11.03 |
| 44926.354166666664 | 10.96 |
| 44926.364583333336 | 10.97 |
| 44926.375 | 10.99 |
| 44926.385416666664 | 10.95 |
| 44926.395833333336 | 10.91 |
| 44926.40625 | 10.82 |
| 44926.416666666664 | 10.8 |
| 44926.427083333336 | 10.75 |
| 44926.4375 | 10.78 |
| 44926.447916666664 | 10.73 |
| 44926.458333333336 | 10.53 |
| 44926.46875 | 10.38 |
| 44926.479166666664 | 10.39 |
| 44926.489583333336 | 10.44 |
| 44926.5 | 10.45 |
| 44926.510416666664 | 10.47 |
| 44926.520833333336 | 10.4 |
| 44926.53125 | 10.31 |
| 44926.541666666664 | 10.31 |
| 44926.552083333336 | 10.31 |
| 44926.5625 | 10.32 |
| 44926.572916666664 | 10.28 |
| 44926.583333333336 | 10.26 |
| 44926.59375 | 10.25 |
| 44926.604166666664 | 10.3 |
| 44926.614583333336 | 10.32 |
| 44926.625 | 10.35 |
| 44926.635416666664 | 10.4 |
| 44926.645833333336 | 10.41 |
| 44926.65625 | 10.42 |
| 44926.666666666664 | 10.5 |
| 44926.677083333336 | 10.51 |
| 44926.6875 | 10.53 |
| 44926.697916666664 | 10.6 |
| 44926.708333333336 | 10.66 |
| 44926.71875 | 10.76 |
| 44926.729166666664 | 10.76 |
| 44926.739583333336 | 10.77 |
| 44926.75 | 10.8 |
| 44926.760416666664 | 10.77 |
| 44926.770833333336 | 10.81 |
| 44926.78125 | 10.83 |
| 44926.791666666664 | 10.83 |
| 44926.802083333336 | 10.9 |
| 44926.8125 | 10.97 |
| 44926.822916666664 | 11 |
| 44926.833333333336 | 11.03 |
| 44926.84375 | 11.05 |
| 44926.854166666664 | 11.04 |
| 44926.864583333336 | 11.09 |
| 44926.875 | 10.97 |
| 44926.885416666664 | 10.97 |
| 44926.895833333336 | 11.05 |
| 44926.90625 | 10.98 |
| 44926.916666666664 | 10.92 |
| 44926.927083333336 | 10.87 |
| 44926.9375 | 10.86 |
| 44926.947916666664 | 10.81 |
| 44926.958333333336 | 10.7 |
| 44926.96875 | 10.51 |
| 44926.979166666664 | 10.58 |
| 44926.989583333336 | 10.61 |
| 44927.0 | 10.61 |
| 44927.010416666664 | 10.55 |
| 44927.020833333336 | 10.57 |
| 44927.03125 | 10.45 |
| 44927.041666666664 | 10.33 |
| 44927.052083333336 | 10.26 |
| 44927.0625 | 10.15 |
| 44927.072916666664 | 10.16 |
| 44927.083333333336 | 10.14 |
| 44927.09375 | 10.16 |
| 44927.104166666664 | 10.22 |
| 44927.114583333336 | 10.25 |
| 44927.125 | 10.24 |
| 44927.135416666664 | 10.25 |
| 44927.145833333336 | 10.28 |